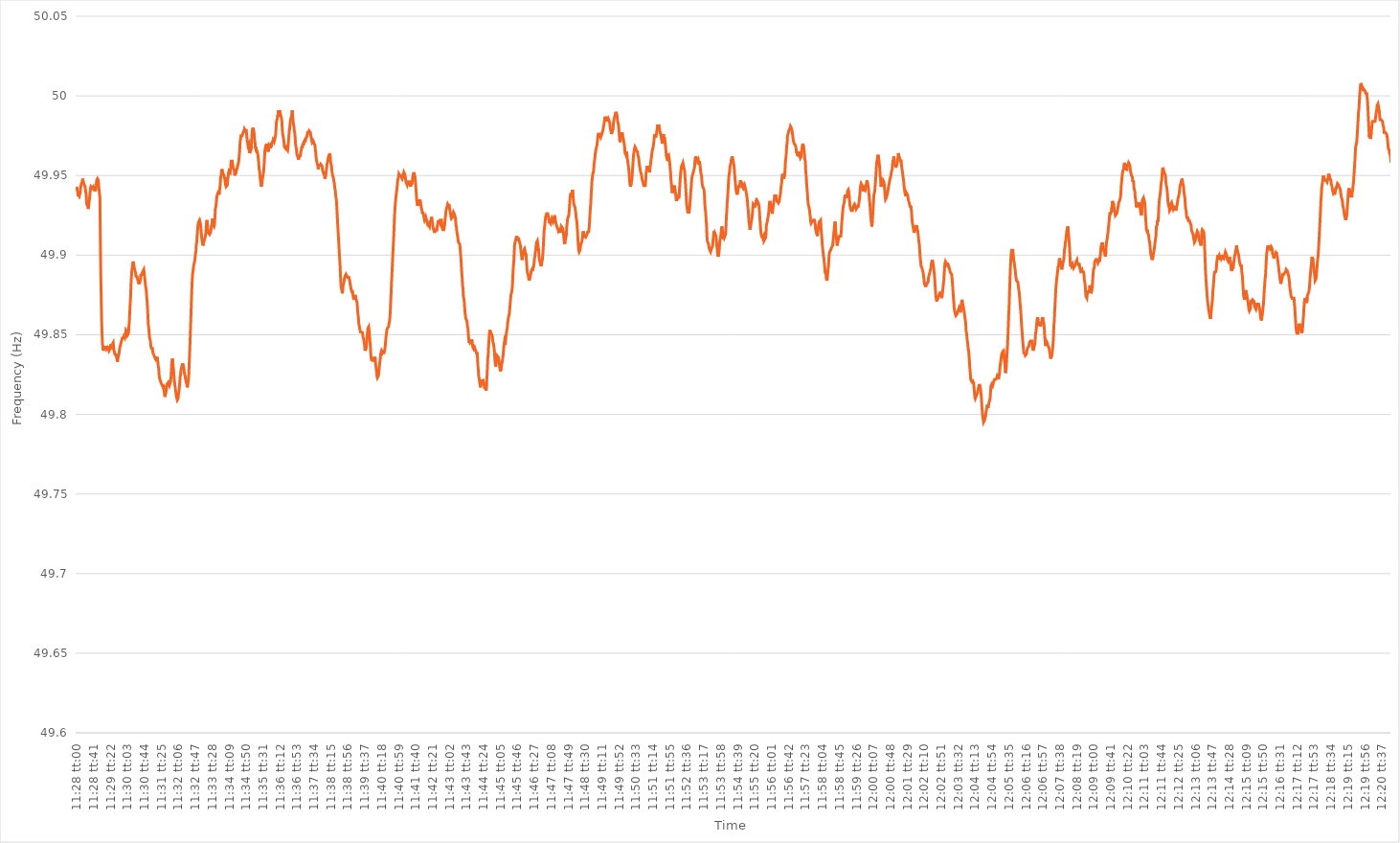
| Category | Series 0 |
|---|---|
| 0.4777777777777778 | 49.943 |
| 0.47778935185185184 | 49.941 |
| 0.47780092592592593 | 49.94 |
| 0.4778125 | 49.937 |
| 0.47782407407407407 | 49.938 |
| 0.4778356481481481 | 49.938 |
| 0.47784722222222226 | 49.937 |
| 0.4778587962962963 | 49.937 |
| 0.4778703703703704 | 49.939 |
| 0.47788194444444443 | 49.942 |
| 0.4778935185185185 | 49.942 |
| 0.47790509259259256 | 49.945 |
| 0.4779166666666667 | 49.945 |
| 0.47792824074074075 | 49.946 |
| 0.47793981481481485 | 49.948 |
| 0.4779513888888889 | 49.947 |
| 0.477962962962963 | 49.946 |
| 0.477974537037037 | 49.946 |
| 0.47798611111111117 | 49.944 |
| 0.4779976851851852 | 49.944 |
| 0.47800925925925924 | 49.943 |
| 0.47802083333333334 | 49.941 |
| 0.4780324074074074 | 49.939 |
| 0.4780439814814815 | 49.937 |
| 0.4780555555555555 | 49.932 |
| 0.47806712962962966 | 49.932 |
| 0.4780787037037037 | 49.931 |
| 0.4780902777777778 | 49.93 |
| 0.47810185185185183 | 49.929 |
| 0.47811342592592593 | 49.932 |
| 0.47812499999999997 | 49.934 |
| 0.4781365740740741 | 49.936 |
| 0.47814814814814816 | 49.939 |
| 0.47815972222222225 | 49.942 |
| 0.4781712962962963 | 49.943 |
| 0.4781828703703704 | 49.943 |
| 0.4781944444444444 | 49.943 |
| 0.47820601851851857 | 49.942 |
| 0.4782175925925926 | 49.942 |
| 0.47822916666666665 | 49.942 |
| 0.47824074074074074 | 49.943 |
| 0.4782523148148148 | 49.942 |
| 0.4782638888888889 | 49.941 |
| 0.4782754629629629 | 49.942 |
| 0.47828703703703707 | 49.94 |
| 0.4782986111111111 | 49.94 |
| 0.4783101851851852 | 49.942 |
| 0.47832175925925924 | 49.944 |
| 0.47833333333333333 | 49.947 |
| 0.47834490740740737 | 49.947 |
| 0.4783564814814815 | 49.948 |
| 0.47836805555555556 | 49.948 |
| 0.47837962962962965 | 49.947 |
| 0.4783912037037037 | 49.943 |
| 0.4784027777777778 | 49.943 |
| 0.4784143518518518 | 49.943 |
| 0.478425925925926 | 49.936 |
| 0.4784375 | 49.908 |
| 0.47844907407407405 | 49.887 |
| 0.47846064814814815 | 49.873 |
| 0.4784722222222222 | 49.859 |
| 0.4784837962962963 | 49.851 |
| 0.4784953703703703 | 49.845 |
| 0.47850694444444447 | 49.842 |
| 0.4785185185185185 | 49.84 |
| 0.4785300925925926 | 49.841 |
| 0.47854166666666664 | 49.841 |
| 0.47855324074074074 | 49.842 |
| 0.4785648148148148 | 49.843 |
| 0.4785763888888889 | 49.841 |
| 0.47858796296296297 | 49.843 |
| 0.47859953703703706 | 49.842 |
| 0.4786111111111111 | 49.841 |
| 0.4786226851851852 | 49.841 |
| 0.47863425925925923 | 49.841 |
| 0.4786458333333334 | 49.842 |
| 0.4786574074074074 | 49.842 |
| 0.4786689814814815 | 49.841 |
| 0.47868055555555555 | 49.84 |
| 0.47869212962962965 | 49.84 |
| 0.4787037037037037 | 49.841 |
| 0.4787152777777777 | 49.842 |
| 0.4787268518518519 | 49.844 |
| 0.4787384259259259 | 49.843 |
| 0.47875 | 49.841 |
| 0.47876157407407405 | 49.842 |
| 0.47877314814814814 | 49.844 |
| 0.4787847222222222 | 49.844 |
| 0.47879629629629633 | 49.845 |
| 0.47880787037037037 | 49.842 |
| 0.47881944444444446 | 49.84 |
| 0.4788310185185185 | 49.839 |
| 0.4788425925925926 | 49.839 |
| 0.47885416666666664 | 49.837 |
| 0.4788657407407408 | 49.838 |
| 0.4788773148148148 | 49.838 |
| 0.4788888888888889 | 49.836 |
| 0.47890046296296296 | 49.835 |
| 0.47891203703703705 | 49.833 |
| 0.4789236111111111 | 49.834 |
| 0.47893518518518513 | 49.836 |
| 0.4789467592592593 | 49.836 |
| 0.4789583333333333 | 49.838 |
| 0.4789699074074074 | 49.84 |
| 0.47898148148148145 | 49.842 |
| 0.47899305555555555 | 49.843 |
| 0.4790046296296296 | 49.844 |
| 0.47901620370370374 | 49.845 |
| 0.4790277777777778 | 49.846 |
| 0.47903935185185187 | 49.847 |
| 0.4790509259259259 | 49.848 |
| 0.4790625 | 49.848 |
| 0.47907407407407404 | 49.848 |
| 0.4790856481481482 | 49.848 |
| 0.47909722222222223 | 49.849 |
| 0.4791087962962963 | 49.849 |
| 0.47912037037037036 | 49.848 |
| 0.47913194444444446 | 49.848 |
| 0.4791435185185185 | 49.85 |
| 0.47915509259259265 | 49.853 |
| 0.4791666666666667 | 49.853 |
| 0.4791782407407407 | 49.853 |
| 0.4791898148148148 | 49.852 |
| 0.47920138888888886 | 49.85 |
| 0.47921296296296295 | 49.85 |
| 0.479224537037037 | 49.851 |
| 0.47923611111111114 | 49.855 |
| 0.4792476851851852 | 49.858 |
| 0.4792592592592593 | 49.864 |
| 0.4792708333333333 | 49.869 |
| 0.4792824074074074 | 49.873 |
| 0.47929398148148145 | 49.881 |
| 0.4793055555555556 | 49.886 |
| 0.47931712962962963 | 49.89 |
| 0.47932870370370373 | 49.892 |
| 0.47934027777777777 | 49.894 |
| 0.47935185185185186 | 49.896 |
| 0.4793634259259259 | 49.895 |
| 0.47937500000000005 | 49.894 |
| 0.4793865740740741 | 49.892 |
| 0.4793981481481482 | 49.892 |
| 0.4794097222222222 | 49.89 |
| 0.47942129629629626 | 49.889 |
| 0.47943287037037036 | 49.887 |
| 0.4794444444444444 | 49.886 |
| 0.47945601851851855 | 49.887 |
| 0.4794675925925926 | 49.886 |
| 0.4794791666666667 | 49.886 |
| 0.4794907407407407 | 49.884 |
| 0.4795023148148148 | 49.882 |
| 0.47951388888888885 | 49.883 |
| 0.479525462962963 | 49.882 |
| 0.47953703703703704 | 49.882 |
| 0.47954861111111113 | 49.884 |
| 0.4795601851851852 | 49.885 |
| 0.47957175925925927 | 49.888 |
| 0.4795833333333333 | 49.887 |
| 0.47959490740740746 | 49.888 |
| 0.4796064814814815 | 49.888 |
| 0.4796180555555556 | 49.888 |
| 0.47962962962962963 | 49.89 |
| 0.47964120370370367 | 49.89 |
| 0.47965277777777776 | 49.891 |
| 0.4796643518518518 | 49.889 |
| 0.47967592592592595 | 49.886 |
| 0.4796875 | 49.884 |
| 0.4796990740740741 | 49.881 |
| 0.4797106481481481 | 49.881 |
| 0.4797222222222222 | 49.878 |
| 0.47973379629629626 | 49.874 |
| 0.4797453703703704 | 49.871 |
| 0.47975694444444444 | 49.867 |
| 0.47976851851851854 | 49.862 |
| 0.4797800925925926 | 49.856 |
| 0.47979166666666667 | 49.854 |
| 0.4798032407407407 | 49.851 |
| 0.47981481481481486 | 49.848 |
| 0.4798263888888889 | 49.847 |
| 0.479837962962963 | 49.846 |
| 0.47984953703703703 | 49.843 |
| 0.4798611111111111 | 49.843 |
| 0.47987268518518517 | 49.841 |
| 0.4798842592592593 | 49.842 |
| 0.47989583333333335 | 49.841 |
| 0.4799074074074074 | 49.839 |
| 0.4799189814814815 | 49.838 |
| 0.4799305555555555 | 49.838 |
| 0.4799421296296296 | 49.837 |
| 0.47995370370370366 | 49.836 |
| 0.4799652777777778 | 49.836 |
| 0.47997685185185185 | 49.835 |
| 0.47998842592592594 | 49.836 |
| 0.48 | 49.835 |
| 0.4800115740740741 | 49.834 |
| 0.4800231481481481 | 49.836 |
| 0.48003472222222227 | 49.834 |
| 0.4800462962962963 | 49.833 |
| 0.4800578703703704 | 49.83 |
| 0.48006944444444444 | 49.829 |
| 0.48008101851851853 | 49.825 |
| 0.48009259259259257 | 49.823 |
| 0.4801041666666667 | 49.822 |
| 0.48011574074074076 | 49.821 |
| 0.4801273148148148 | 49.821 |
| 0.4801388888888889 | 49.821 |
| 0.48015046296296293 | 49.819 |
| 0.480162037037037 | 49.819 |
| 0.48017361111111106 | 49.818 |
| 0.4801851851851852 | 49.819 |
| 0.48019675925925925 | 49.817 |
| 0.48020833333333335 | 49.818 |
| 0.4802199074074074 | 49.815 |
| 0.4802314814814815 | 49.813 |
| 0.4802430555555555 | 49.811 |
| 0.48025462962962967 | 49.811 |
| 0.4802662037037037 | 49.811 |
| 0.4802777777777778 | 49.815 |
| 0.48028935185185184 | 49.816 |
| 0.48030092592592594 | 49.819 |
| 0.4803125 | 49.819 |
| 0.4803240740740741 | 49.819 |
| 0.48033564814814816 | 49.82 |
| 0.4803472222222222 | 49.819 |
| 0.4803587962962963 | 49.819 |
| 0.48037037037037034 | 49.818 |
| 0.48038194444444443 | 49.819 |
| 0.48039351851851847 | 49.82 |
| 0.4804050925925926 | 49.821 |
| 0.48041666666666666 | 49.824 |
| 0.48042824074074075 | 49.829 |
| 0.4804398148148148 | 49.833 |
| 0.4804513888888889 | 49.835 |
| 0.4804629629629629 | 49.834 |
| 0.4804745370370371 | 49.83 |
| 0.4804861111111111 | 49.828 |
| 0.4804976851851852 | 49.824 |
| 0.48050925925925925 | 49.821 |
| 0.48052083333333334 | 49.819 |
| 0.4805324074074074 | 49.817 |
| 0.48054398148148153 | 49.815 |
| 0.48055555555555557 | 49.813 |
| 0.48056712962962966 | 49.811 |
| 0.4805787037037037 | 49.811 |
| 0.48059027777777774 | 49.809 |
| 0.48060185185185184 | 49.809 |
| 0.4806134259259259 | 49.81 |
| 0.480625 | 49.813 |
| 0.48063657407407406 | 49.814 |
| 0.48064814814814816 | 49.817 |
| 0.4806597222222222 | 49.82 |
| 0.4806712962962963 | 49.824 |
| 0.48068287037037033 | 49.825 |
| 0.4806944444444445 | 49.828 |
| 0.4807060185185185 | 49.829 |
| 0.4807175925925926 | 49.83 |
| 0.48072916666666665 | 49.83 |
| 0.48074074074074075 | 49.832 |
| 0.4807523148148148 | 49.831 |
| 0.48076388888888894 | 49.83 |
| 0.480775462962963 | 49.829 |
| 0.48078703703703707 | 49.826 |
| 0.4807986111111111 | 49.826 |
| 0.4808101851851852 | 49.824 |
| 0.48082175925925924 | 49.822 |
| 0.4808333333333333 | 49.822 |
| 0.48084490740740743 | 49.82 |
| 0.48085648148148147 | 49.819 |
| 0.48086805555555556 | 49.817 |
| 0.4808796296296296 | 49.818 |
| 0.4808912037037037 | 49.82 |
| 0.48090277777777773 | 49.822 |
| 0.4809143518518519 | 49.826 |
| 0.4809259259259259 | 49.833 |
| 0.4809375 | 49.839 |
| 0.48094907407407406 | 49.846 |
| 0.48096064814814815 | 49.854 |
| 0.4809722222222222 | 49.862 |
| 0.48098379629629634 | 49.87 |
| 0.4809953703703704 | 49.877 |
| 0.4810069444444445 | 49.884 |
| 0.4810185185185185 | 49.888 |
| 0.4810300925925926 | 49.89 |
| 0.48104166666666665 | 49.892 |
| 0.4810532407407408 | 49.894 |
| 0.48106481481481483 | 49.895 |
| 0.4810763888888889 | 49.896 |
| 0.48108796296296297 | 49.898 |
| 0.481099537037037 | 49.901 |
| 0.4811111111111111 | 49.902 |
| 0.48112268518518514 | 49.907 |
| 0.4811342592592593 | 49.908 |
| 0.48114583333333333 | 49.912 |
| 0.4811574074074074 | 49.915 |
| 0.48116898148148146 | 49.919 |
| 0.48118055555555556 | 49.919 |
| 0.4811921296296296 | 49.921 |
| 0.48120370370370374 | 49.921 |
| 0.4812152777777778 | 49.922 |
| 0.4812268518518519 | 49.922 |
| 0.4812384259259259 | 49.92 |
| 0.48125 | 49.917 |
| 0.48126157407407405 | 49.914 |
| 0.4812731481481482 | 49.911 |
| 0.48128472222222224 | 49.909 |
| 0.48129629629629633 | 49.909 |
| 0.48130787037037037 | 49.906 |
| 0.4813194444444444 | 49.907 |
| 0.4813310185185185 | 49.907 |
| 0.48134259259259254 | 49.909 |
| 0.4813541666666667 | 49.909 |
| 0.48136574074074073 | 49.909 |
| 0.4813773148148148 | 49.912 |
| 0.48138888888888887 | 49.914 |
| 0.48140046296296296 | 49.918 |
| 0.481412037037037 | 49.921 |
| 0.48142361111111115 | 49.922 |
| 0.4814351851851852 | 49.919 |
| 0.4814467592592593 | 49.915 |
| 0.4814583333333333 | 49.914 |
| 0.4814699074074074 | 49.914 |
| 0.48148148148148145 | 49.914 |
| 0.4814930555555556 | 49.913 |
| 0.48150462962962964 | 49.913 |
| 0.48151620370370374 | 49.914 |
| 0.4815277777777778 | 49.915 |
| 0.4815393518518518 | 49.917 |
| 0.4815509259259259 | 49.919 |
| 0.48156249999999995 | 49.92 |
| 0.4815740740740741 | 49.923 |
| 0.48158564814814814 | 49.922 |
| 0.48159722222222223 | 49.919 |
| 0.48160879629629627 | 49.919 |
| 0.48162037037037037 | 49.918 |
| 0.4816319444444444 | 49.919 |
| 0.48164351851851855 | 49.923 |
| 0.4816550925925926 | 49.929 |
| 0.4816666666666667 | 49.93 |
| 0.4816782407407407 | 49.932 |
| 0.4816898148148148 | 49.935 |
| 0.48170138888888886 | 49.937 |
| 0.481712962962963 | 49.937 |
| 0.48172453703703705 | 49.939 |
| 0.48173611111111114 | 49.939 |
| 0.4817476851851852 | 49.94 |
| 0.4817592592592593 | 49.938 |
| 0.4817708333333333 | 49.94 |
| 0.48178240740740735 | 49.942 |
| 0.4817939814814815 | 49.945 |
| 0.48180555555555554 | 49.949 |
| 0.48181712962962964 | 49.95 |
| 0.4818287037037037 | 49.953 |
| 0.48184027777777777 | 49.954 |
| 0.4818518518518518 | 49.953 |
| 0.48186342592592596 | 49.953 |
| 0.481875 | 49.951 |
| 0.4818865740740741 | 49.951 |
| 0.48189814814814813 | 49.95 |
| 0.4819097222222222 | 49.948 |
| 0.48192129629629626 | 49.949 |
| 0.4819328703703704 | 49.949 |
| 0.48194444444444445 | 49.944 |
| 0.48195601851851855 | 49.943 |
| 0.4819675925925926 | 49.943 |
| 0.4819791666666667 | 49.943 |
| 0.4819907407407407 | 49.944 |
| 0.48200231481481487 | 49.948 |
| 0.4820138888888889 | 49.949 |
| 0.48202546296296295 | 49.952 |
| 0.48203703703703704 | 49.953 |
| 0.4820486111111111 | 49.953 |
| 0.4820601851851852 | 49.953 |
| 0.4820717592592592 | 49.952 |
| 0.48208333333333336 | 49.954 |
| 0.4820949074074074 | 49.959 |
| 0.4821064814814815 | 49.959 |
| 0.48211805555555554 | 49.959 |
| 0.48212962962962963 | 49.959 |
| 0.48214120370370367 | 49.959 |
| 0.4821527777777778 | 49.955 |
| 0.48216435185185186 | 49.955 |
| 0.48217592592592595 | 49.954 |
| 0.4821875 | 49.953 |
| 0.4821990740740741 | 49.95 |
| 0.4822106481481481 | 49.952 |
| 0.4822222222222223 | 49.951 |
| 0.4822337962962963 | 49.952 |
| 0.48224537037037035 | 49.953 |
| 0.48225694444444445 | 49.954 |
| 0.4822685185185185 | 49.955 |
| 0.4822800925925926 | 49.956 |
| 0.4822916666666666 | 49.957 |
| 0.48230324074074077 | 49.958 |
| 0.4823148148148148 | 49.96 |
| 0.4823263888888889 | 49.963 |
| 0.48233796296296294 | 49.966 |
| 0.48234953703703703 | 49.971 |
| 0.4823611111111111 | 49.973 |
| 0.4823726851851852 | 49.975 |
| 0.48238425925925926 | 49.975 |
| 0.48239583333333336 | 49.975 |
| 0.4824074074074074 | 49.975 |
| 0.4824189814814815 | 49.976 |
| 0.48243055555555553 | 49.976 |
| 0.4824421296296297 | 49.976 |
| 0.4824537037037037 | 49.978 |
| 0.4824652777777778 | 49.977 |
| 0.48247685185185185 | 49.979 |
| 0.4824884259259259 | 49.979 |
| 0.4825 | 49.978 |
| 0.482511574074074 | 49.979 |
| 0.4825231481481482 | 49.978 |
| 0.4825347222222222 | 49.975 |
| 0.4825462962962963 | 49.972 |
| 0.48255787037037035 | 49.971 |
| 0.48256944444444444 | 49.969 |
| 0.4825810185185185 | 49.969 |
| 0.48259259259259263 | 49.97 |
| 0.48260416666666667 | 49.966 |
| 0.48261574074074076 | 49.964 |
| 0.4826273148148148 | 49.964 |
| 0.4826388888888889 | 49.964 |
| 0.48265046296296293 | 49.966 |
| 0.4826620370370371 | 49.967 |
| 0.4826736111111111 | 49.973 |
| 0.4826851851851852 | 49.977 |
| 0.48269675925925926 | 49.979 |
| 0.48270833333333335 | 49.98 |
| 0.4827199074074074 | 49.98 |
| 0.48273148148148143 | 49.978 |
| 0.4827430555555556 | 49.976 |
| 0.4827546296296296 | 49.972 |
| 0.4827662037037037 | 49.971 |
| 0.48277777777777775 | 49.967 |
| 0.48278935185185184 | 49.968 |
| 0.4828009259259259 | 49.965 |
| 0.48281250000000003 | 49.966 |
| 0.48282407407407407 | 49.966 |
| 0.48283564814814817 | 49.964 |
| 0.4828472222222222 | 49.963 |
| 0.4828587962962963 | 49.96 |
| 0.48287037037037034 | 49.958 |
| 0.4828819444444445 | 49.954 |
| 0.4828935185185185 | 49.953 |
| 0.4829050925925926 | 49.95 |
| 0.48291666666666666 | 49.947 |
| 0.48292824074074076 | 49.945 |
| 0.4829398148148148 | 49.943 |
| 0.48295138888888894 | 49.944 |
| 0.482962962962963 | 49.945 |
| 0.482974537037037 | 49.948 |
| 0.4829861111111111 | 49.948 |
| 0.48299768518518515 | 49.951 |
| 0.48300925925925925 | 49.953 |
| 0.4830208333333333 | 49.957 |
| 0.48303240740740744 | 49.961 |
| 0.4830439814814815 | 49.966 |
| 0.48305555555555557 | 49.967 |
| 0.4830671296296296 | 49.969 |
| 0.4830787037037037 | 49.968 |
| 0.48309027777777774 | 49.97 |
| 0.4831018518518519 | 49.969 |
| 0.48311342592592593 | 49.966 |
| 0.483125 | 49.967 |
| 0.48313657407407407 | 49.965 |
| 0.48314814814814816 | 49.968 |
| 0.4831597222222222 | 49.969 |
| 0.48317129629629635 | 49.969 |
| 0.4831828703703704 | 49.968 |
| 0.4831944444444444 | 49.967 |
| 0.4832060185185185 | 49.969 |
| 0.48321759259259256 | 49.968 |
| 0.48322916666666665 | 49.97 |
| 0.4832407407407407 | 49.97 |
| 0.48325231481481484 | 49.971 |
| 0.4832638888888889 | 49.97 |
| 0.483275462962963 | 49.972 |
| 0.483287037037037 | 49.972 |
| 0.4832986111111111 | 49.971 |
| 0.48331018518518515 | 49.971 |
| 0.4833217592592593 | 49.973 |
| 0.48333333333333334 | 49.973 |
| 0.48334490740740743 | 49.976 |
| 0.48335648148148147 | 49.98 |
| 0.48336805555555556 | 49.984 |
| 0.4833796296296296 | 49.985 |
| 0.48339120370370375 | 49.986 |
| 0.4834027777777778 | 49.988 |
| 0.4834143518518519 | 49.987 |
| 0.4834259259259259 | 49.991 |
| 0.48343749999999996 | 49.989 |
| 0.48344907407407406 | 49.991 |
| 0.4834606481481481 | 49.99 |
| 0.48347222222222225 | 49.989 |
| 0.4834837962962963 | 49.988 |
| 0.4834953703703704 | 49.987 |
| 0.4835069444444444 | 49.986 |
| 0.4835185185185185 | 49.984 |
| 0.48353009259259255 | 49.979 |
| 0.4835416666666667 | 49.976 |
| 0.48355324074074074 | 49.976 |
| 0.48356481481481484 | 49.973 |
| 0.4835763888888889 | 49.971 |
| 0.48358796296296297 | 49.968 |
| 0.483599537037037 | 49.968 |
| 0.48361111111111116 | 49.968 |
| 0.4836226851851852 | 49.967 |
| 0.4836342592592593 | 49.969 |
| 0.48364583333333333 | 49.968 |
| 0.4836574074074074 | 49.967 |
| 0.48366898148148146 | 49.967 |
| 0.4836805555555555 | 49.966 |
| 0.48369212962962965 | 49.968 |
| 0.4837037037037037 | 49.972 |
| 0.4837152777777778 | 49.975 |
| 0.4837268518518518 | 49.978 |
| 0.4837384259259259 | 49.98 |
| 0.48374999999999996 | 49.983 |
| 0.4837615740740741 | 49.985 |
| 0.48377314814814815 | 49.986 |
| 0.48378472222222224 | 49.987 |
| 0.4837962962962963 | 49.988 |
| 0.4838078703703704 | 49.991 |
| 0.4838194444444444 | 49.987 |
| 0.48383101851851856 | 49.985 |
| 0.4838425925925926 | 49.982 |
| 0.4838541666666667 | 49.981 |
| 0.48386574074074074 | 49.978 |
| 0.48387731481481483 | 49.977 |
| 0.48388888888888887 | 49.974 |
| 0.483900462962963 | 49.97 |
| 0.48391203703703706 | 49.968 |
| 0.4839236111111111 | 49.967 |
| 0.4839351851851852 | 49.964 |
| 0.48394675925925923 | 49.964 |
| 0.4839583333333333 | 49.962 |
| 0.48396990740740736 | 49.961 |
| 0.4839814814814815 | 49.96 |
| 0.48399305555555555 | 49.962 |
| 0.48400462962962965 | 49.961 |
| 0.4840162037037037 | 49.963 |
| 0.4840277777777778 | 49.962 |
| 0.4840393518518518 | 49.963 |
| 0.48405092592592597 | 49.965 |
| 0.4840625 | 49.966 |
| 0.4840740740740741 | 49.968 |
| 0.48408564814814814 | 49.967 |
| 0.48409722222222223 | 49.969 |
| 0.4841087962962963 | 49.97 |
| 0.4841203703703704 | 49.969 |
| 0.48413194444444446 | 49.971 |
| 0.4841435185185185 | 49.971 |
| 0.4841550925925926 | 49.972 |
| 0.48416666666666663 | 49.971 |
| 0.48417824074074073 | 49.972 |
| 0.48418981481481477 | 49.973 |
| 0.4842013888888889 | 49.973 |
| 0.48421296296296296 | 49.973 |
| 0.48422453703703705 | 49.975 |
| 0.4842361111111111 | 49.977 |
| 0.4842476851851852 | 49.977 |
| 0.4842592592592592 | 49.977 |
| 0.4842708333333334 | 49.977 |
| 0.4842824074074074 | 49.978 |
| 0.4842939814814815 | 49.978 |
| 0.48430555555555554 | 49.978 |
| 0.48431712962962964 | 49.977 |
| 0.4843287037037037 | 49.975 |
| 0.48434027777777783 | 49.974 |
| 0.48435185185185187 | 49.972 |
| 0.48436342592592596 | 49.971 |
| 0.484375 | 49.971 |
| 0.48438657407407404 | 49.972 |
| 0.48439814814814813 | 49.972 |
| 0.48440972222222217 | 49.971 |
| 0.4844212962962963 | 49.97 |
| 0.48443287037037036 | 49.97 |
| 0.48444444444444446 | 49.969 |
| 0.4844560185185185 | 49.966 |
| 0.4844675925925926 | 49.964 |
| 0.4844791666666666 | 49.961 |
| 0.4844907407407408 | 49.961 |
| 0.4845023148148148 | 49.958 |
| 0.4845138888888889 | 49.957 |
| 0.48452546296296295 | 49.956 |
| 0.48453703703703704 | 49.954 |
| 0.4845486111111111 | 49.956 |
| 0.48456018518518523 | 49.957 |
| 0.48457175925925927 | 49.956 |
| 0.48458333333333337 | 49.957 |
| 0.4845949074074074 | 49.956 |
| 0.4846064814814815 | 49.957 |
| 0.48461805555555554 | 49.957 |
| 0.4846296296296296 | 49.957 |
| 0.4846412037037037 | 49.956 |
| 0.48465277777777777 | 49.954 |
| 0.48466435185185186 | 49.953 |
| 0.4846759259259259 | 49.952 |
| 0.4846875 | 49.951 |
| 0.48469907407407403 | 49.951 |
| 0.4847106481481482 | 49.95 |
| 0.4847222222222222 | 49.948 |
| 0.4847337962962963 | 49.948 |
| 0.48474537037037035 | 49.95 |
| 0.48475694444444445 | 49.952 |
| 0.4847685185185185 | 49.954 |
| 0.48478009259259264 | 49.957 |
| 0.4847916666666667 | 49.958 |
| 0.48480324074074077 | 49.959 |
| 0.4848148148148148 | 49.961 |
| 0.4848263888888889 | 49.962 |
| 0.48483796296296294 | 49.963 |
| 0.484849537037037 | 49.962 |
| 0.48486111111111113 | 49.964 |
| 0.48487268518518517 | 49.961 |
| 0.48488425925925926 | 49.958 |
| 0.4848958333333333 | 49.957 |
| 0.4849074074074074 | 49.956 |
| 0.48491898148148144 | 49.953 |
| 0.4849305555555556 | 49.951 |
| 0.4849421296296296 | 49.95 |
| 0.4849537037037037 | 49.949 |
| 0.48496527777777776 | 49.948 |
| 0.48497685185185185 | 49.946 |
| 0.4849884259259259 | 49.945 |
| 0.48500000000000004 | 49.942 |
| 0.4850115740740741 | 49.941 |
| 0.4850231481481482 | 49.938 |
| 0.4850347222222222 | 49.936 |
| 0.4850462962962963 | 49.934 |
| 0.48505787037037035 | 49.929 |
| 0.4850694444444445 | 49.925 |
| 0.48508101851851854 | 49.919 |
| 0.4850925925925926 | 49.915 |
| 0.48510416666666667 | 49.91 |
| 0.4851157407407407 | 49.906 |
| 0.4851273148148148 | 49.901 |
| 0.48513888888888884 | 49.897 |
| 0.485150462962963 | 49.892 |
| 0.48516203703703703 | 49.885 |
| 0.4851736111111111 | 49.881 |
| 0.48518518518518516 | 49.879 |
| 0.48519675925925926 | 49.878 |
| 0.4852083333333333 | 49.876 |
| 0.48521990740740745 | 49.878 |
| 0.4852314814814815 | 49.881 |
| 0.4852430555555556 | 49.881 |
| 0.4852546296296296 | 49.883 |
| 0.4852662037037037 | 49.885 |
| 0.48527777777777775 | 49.886 |
| 0.4852893518518519 | 49.887 |
| 0.48530092592592594 | 49.887 |
| 0.48531250000000004 | 49.888 |
| 0.4853240740740741 | 49.888 |
| 0.4853356481481481 | 49.887 |
| 0.4853472222222222 | 49.887 |
| 0.48535879629629625 | 49.886 |
| 0.4853703703703704 | 49.886 |
| 0.48538194444444444 | 49.886 |
| 0.48539351851851853 | 49.886 |
| 0.48540509259259257 | 49.886 |
| 0.48541666666666666 | 49.884 |
| 0.4854282407407407 | 49.882 |
| 0.48543981481481485 | 49.881 |
| 0.4854513888888889 | 49.879 |
| 0.485462962962963 | 49.878 |
| 0.485474537037037 | 49.877 |
| 0.4854861111111111 | 49.878 |
| 0.48549768518518516 | 49.876 |
| 0.4855092592592593 | 49.875 |
| 0.48552083333333335 | 49.873 |
| 0.48553240740740744 | 49.872 |
| 0.4855439814814815 | 49.874 |
| 0.4855555555555556 | 49.873 |
| 0.4855671296296296 | 49.875 |
| 0.48557870370370365 | 49.875 |
| 0.4855902777777778 | 49.873 |
| 0.48560185185185184 | 49.873 |
| 0.48561342592592593 | 49.871 |
| 0.485625 | 49.87 |
| 0.48563657407407407 | 49.866 |
| 0.4856481481481481 | 49.863 |
| 0.48565972222222226 | 49.861 |
| 0.4856712962962963 | 49.857 |
| 0.4856828703703704 | 49.856 |
| 0.48569444444444443 | 49.854 |
| 0.4857060185185185 | 49.854 |
| 0.48571759259259256 | 49.852 |
| 0.4857291666666667 | 49.851 |
| 0.48574074074074075 | 49.852 |
| 0.48575231481481485 | 49.851 |
| 0.4857638888888889 | 49.852 |
| 0.485775462962963 | 49.851 |
| 0.485787037037037 | 49.849 |
| 0.48579861111111106 | 49.848 |
| 0.4858101851851852 | 49.847 |
| 0.48582175925925924 | 49.845 |
| 0.48583333333333334 | 49.844 |
| 0.4858449074074074 | 49.84 |
| 0.4858564814814815 | 49.84 |
| 0.4858680555555555 | 49.84 |
| 0.48587962962962966 | 49.842 |
| 0.4858912037037037 | 49.845 |
| 0.4859027777777778 | 49.849 |
| 0.48591435185185183 | 49.851 |
| 0.48592592592592593 | 49.854 |
| 0.48593749999999997 | 49.854 |
| 0.4859490740740741 | 49.855 |
| 0.48596064814814816 | 49.855 |
| 0.48597222222222225 | 49.85 |
| 0.4859837962962963 | 49.846 |
| 0.4859953703703704 | 49.843 |
| 0.4860069444444444 | 49.838 |
| 0.48601851851851857 | 49.835 |
| 0.4860300925925926 | 49.834 |
| 0.48604166666666665 | 49.834 |
| 0.48605324074074074 | 49.834 |
| 0.4860648148148148 | 49.834 |
| 0.4860763888888889 | 49.834 |
| 0.4860879629629629 | 49.835 |
| 0.48609953703703707 | 49.836 |
| 0.4861111111111111 | 49.833 |
| 0.4861226851851852 | 49.836 |
| 0.48613425925925924 | 49.834 |
| 0.48614583333333333 | 49.831 |
| 0.48615740740740737 | 49.829 |
| 0.4861689814814815 | 49.827 |
| 0.48618055555555556 | 49.824 |
| 0.48619212962962965 | 49.823 |
| 0.4862037037037037 | 49.823 |
| 0.4862152777777778 | 49.824 |
| 0.4862268518518518 | 49.825 |
| 0.486238425925926 | 49.828 |
| 0.48625 | 49.831 |
| 0.4862615740740741 | 49.833 |
| 0.48627314814814815 | 49.835 |
| 0.4862847222222222 | 49.838 |
| 0.4862962962962963 | 49.839 |
| 0.4863078703703703 | 49.84 |
| 0.48631944444444447 | 49.84 |
| 0.4863310185185185 | 49.839 |
| 0.4863425925925926 | 49.84 |
| 0.48635416666666664 | 49.839 |
| 0.48636574074074074 | 49.838 |
| 0.4863773148148148 | 49.838 |
| 0.4863888888888889 | 49.84 |
| 0.48640046296296297 | 49.841 |
| 0.48641203703703706 | 49.843 |
| 0.4864236111111111 | 49.846 |
| 0.4864351851851852 | 49.849 |
| 0.48644675925925923 | 49.851 |
| 0.4864583333333334 | 49.853 |
| 0.4864699074074074 | 49.854 |
| 0.4864814814814815 | 49.854 |
| 0.48649305555555555 | 49.854 |
| 0.48650462962962965 | 49.855 |
| 0.4865162037037037 | 49.857 |
| 0.4865277777777777 | 49.858 |
| 0.4865393518518519 | 49.86 |
| 0.4865509259259259 | 49.864 |
| 0.4865625 | 49.87 |
| 0.48657407407407405 | 49.875 |
| 0.48658564814814814 | 49.882 |
| 0.4865972222222222 | 49.887 |
| 0.48660879629629633 | 49.893 |
| 0.48662037037037037 | 49.898 |
| 0.48663194444444446 | 49.904 |
| 0.4866435185185185 | 49.909 |
| 0.4866550925925926 | 49.915 |
| 0.48666666666666664 | 49.922 |
| 0.4866782407407408 | 49.927 |
| 0.4866898148148148 | 49.931 |
| 0.4867013888888889 | 49.934 |
| 0.48671296296296296 | 49.937 |
| 0.48672453703703705 | 49.939 |
| 0.4867361111111111 | 49.941 |
| 0.48674768518518513 | 49.943 |
| 0.4867592592592593 | 49.947 |
| 0.4867708333333333 | 49.948 |
| 0.4867824074074074 | 49.949 |
| 0.48679398148148145 | 49.951 |
| 0.48680555555555555 | 49.951 |
| 0.4868171296296296 | 49.95 |
| 0.48682870370370374 | 49.95 |
| 0.4868402777777778 | 49.95 |
| 0.48685185185185187 | 49.95 |
| 0.4868634259259259 | 49.949 |
| 0.486875 | 49.949 |
| 0.48688657407407404 | 49.948 |
| 0.4868981481481482 | 49.949 |
| 0.48690972222222223 | 49.95 |
| 0.4869212962962963 | 49.951 |
| 0.48693287037037036 | 49.952 |
| 0.48694444444444446 | 49.952 |
| 0.4869560185185185 | 49.952 |
| 0.48696759259259265 | 49.95 |
| 0.4869791666666667 | 49.948 |
| 0.4869907407407407 | 49.946 |
| 0.4870023148148148 | 49.946 |
| 0.48701388888888886 | 49.946 |
| 0.48702546296296295 | 49.944 |
| 0.487037037037037 | 49.945 |
| 0.48704861111111114 | 49.944 |
| 0.4870601851851852 | 49.946 |
| 0.4870717592592593 | 49.946 |
| 0.4870833333333333 | 49.946 |
| 0.4870949074074074 | 49.946 |
| 0.48710648148148145 | 49.944 |
| 0.4871180555555556 | 49.943 |
| 0.48712962962962963 | 49.944 |
| 0.48714120370370373 | 49.944 |
| 0.48715277777777777 | 49.944 |
| 0.48716435185185186 | 49.945 |
| 0.4871759259259259 | 49.948 |
| 0.48718750000000005 | 49.95 |
| 0.4871990740740741 | 49.951 |
| 0.4872106481481482 | 49.952 |
| 0.4872222222222222 | 49.952 |
| 0.48723379629629626 | 49.95 |
| 0.48724537037037036 | 49.949 |
| 0.4872569444444444 | 49.946 |
| 0.48726851851851855 | 49.943 |
| 0.4872800925925926 | 49.939 |
| 0.4872916666666667 | 49.935 |
| 0.4873032407407407 | 49.933 |
| 0.4873148148148148 | 49.931 |
| 0.48732638888888885 | 49.932 |
| 0.487337962962963 | 49.934 |
| 0.48734953703703704 | 49.935 |
| 0.48736111111111113 | 49.934 |
| 0.4873726851851852 | 49.934 |
| 0.48738425925925927 | 49.934 |
| 0.4873958333333333 | 49.934 |
| 0.48740740740740746 | 49.932 |
| 0.4874189814814815 | 49.93 |
| 0.4874305555555556 | 49.929 |
| 0.48744212962962963 | 49.928 |
| 0.48745370370370367 | 49.926 |
| 0.48746527777777776 | 49.927 |
| 0.4874768518518518 | 49.926 |
| 0.48748842592592595 | 49.925 |
| 0.4875 | 49.923 |
| 0.4875115740740741 | 49.922 |
| 0.4875231481481481 | 49.922 |
| 0.4875347222222222 | 49.922 |
| 0.48754629629629626 | 49.924 |
| 0.4875578703703704 | 49.923 |
| 0.48756944444444444 | 49.922 |
| 0.48758101851851854 | 49.921 |
| 0.4875925925925926 | 49.92 |
| 0.48760416666666667 | 49.92 |
| 0.4876157407407407 | 49.918 |
| 0.48762731481481486 | 49.919 |
| 0.4876388888888889 | 49.919 |
| 0.487650462962963 | 49.918 |
| 0.48766203703703703 | 49.92 |
| 0.4876736111111111 | 49.921 |
| 0.48768518518518517 | 49.921 |
| 0.4876967592592592 | 49.922 |
| 0.48770833333333335 | 49.924 |
| 0.4877199074074074 | 49.922 |
| 0.4877314814814815 | 49.921 |
| 0.4877430555555555 | 49.918 |
| 0.4877546296296296 | 49.917 |
| 0.48776620370370366 | 49.916 |
| 0.4877777777777778 | 49.915 |
| 0.48778935185185185 | 49.914 |
| 0.48780092592592594 | 49.915 |
| 0.4878125 | 49.915 |
| 0.4878240740740741 | 49.915 |
| 0.4878356481481481 | 49.916 |
| 0.48784722222222227 | 49.915 |
| 0.4878587962962963 | 49.917 |
| 0.4878703703703704 | 49.918 |
| 0.48788194444444444 | 49.92 |
| 0.48789351851851853 | 49.921 |
| 0.48790509259259257 | 49.922 |
| 0.4879166666666667 | 49.921 |
| 0.48792824074074076 | 49.921 |
| 0.4879398148148148 | 49.92 |
| 0.4879513888888889 | 49.922 |
| 0.48796296296296293 | 49.922 |
| 0.487974537037037 | 49.922 |
| 0.48798611111111106 | 49.922 |
| 0.4879976851851852 | 49.919 |
| 0.48800925925925925 | 49.917 |
| 0.48802083333333335 | 49.916 |
| 0.4880324074074074 | 49.916 |
| 0.4880439814814815 | 49.916 |
| 0.4880555555555555 | 49.916 |
| 0.48806712962962967 | 49.918 |
| 0.4880787037037037 | 49.92 |
| 0.4880902777777778 | 49.923 |
| 0.48810185185185184 | 49.925 |
| 0.48811342592592594 | 49.928 |
| 0.488125 | 49.928 |
| 0.4881365740740741 | 49.93 |
| 0.48814814814814816 | 49.931 |
| 0.48815972222222226 | 49.932 |
| 0.4881712962962963 | 49.932 |
| 0.48818287037037034 | 49.931 |
| 0.48819444444444443 | 49.932 |
| 0.48820601851851847 | 49.93 |
| 0.4882175925925926 | 49.929 |
| 0.48822916666666666 | 49.927 |
| 0.48824074074074075 | 49.926 |
| 0.4882523148148148 | 49.924 |
| 0.4882638888888889 | 49.923 |
| 0.4882754629629629 | 49.923 |
| 0.4882870370370371 | 49.923 |
| 0.4882986111111111 | 49.924 |
| 0.4883101851851852 | 49.926 |
| 0.48832175925925925 | 49.927 |
| 0.48833333333333334 | 49.927 |
| 0.4883449074074074 | 49.926 |
| 0.48835648148148153 | 49.925 |
| 0.48836805555555557 | 49.924 |
| 0.48837962962962966 | 49.923 |
| 0.4883912037037037 | 49.919 |
| 0.48840277777777774 | 49.918 |
| 0.48841435185185184 | 49.915 |
| 0.4884259259259259 | 49.915 |
| 0.4884375 | 49.912 |
| 0.48844907407407406 | 49.91 |
| 0.48846064814814816 | 49.908 |
| 0.4884722222222222 | 49.908 |
| 0.4884837962962963 | 49.908 |
| 0.48849537037037033 | 49.907 |
| 0.4885069444444445 | 49.905 |
| 0.4885185185185185 | 49.901 |
| 0.4885300925925926 | 49.898 |
| 0.48854166666666665 | 49.894 |
| 0.48855324074074075 | 49.889 |
| 0.4885648148148148 | 49.886 |
| 0.48857638888888894 | 49.881 |
| 0.488587962962963 | 49.879 |
| 0.48859953703703707 | 49.874 |
| 0.4886111111111111 | 49.873 |
| 0.4886226851851852 | 49.871 |
| 0.48863425925925924 | 49.867 |
| 0.4886458333333333 | 49.864 |
| 0.48865740740740743 | 49.862 |
| 0.48866898148148147 | 49.86 |
| 0.48868055555555556 | 49.86 |
| 0.4886921296296296 | 49.859 |
| 0.4887037037037037 | 49.858 |
| 0.48871527777777773 | 49.855 |
| 0.4887268518518519 | 49.854 |
| 0.4887384259259259 | 49.85 |
| 0.48875 | 49.847 |
| 0.48876157407407406 | 49.845 |
| 0.48877314814814815 | 49.846 |
| 0.4887847222222222 | 49.845 |
| 0.48879629629629634 | 49.845 |
| 0.4888078703703704 | 49.845 |
| 0.4888194444444445 | 49.846 |
| 0.4888310185185185 | 49.847 |
| 0.4888425925925926 | 49.846 |
| 0.48885416666666665 | 49.844 |
| 0.4888657407407408 | 49.842 |
| 0.48887731481481483 | 49.842 |
| 0.4888888888888889 | 49.841 |
| 0.48890046296296297 | 49.841 |
| 0.488912037037037 | 49.842 |
| 0.4889236111111111 | 49.841 |
| 0.48893518518518514 | 49.841 |
| 0.4889467592592593 | 49.84 |
| 0.48895833333333333 | 49.84 |
| 0.4889699074074074 | 49.838 |
| 0.48898148148148146 | 49.839 |
| 0.48899305555555556 | 49.836 |
| 0.4890046296296296 | 49.831 |
| 0.48901620370370374 | 49.828 |
| 0.4890277777777778 | 49.824 |
| 0.4890393518518519 | 49.823 |
| 0.4890509259259259 | 49.821 |
| 0.4890625 | 49.819 |
| 0.48907407407407405 | 49.817 |
| 0.4890856481481482 | 49.818 |
| 0.48909722222222224 | 49.82 |
| 0.48910879629629633 | 49.822 |
| 0.48912037037037037 | 49.82 |
| 0.4891319444444444 | 49.82 |
| 0.4891435185185185 | 49.82 |
| 0.48915509259259254 | 49.821 |
| 0.4891666666666667 | 49.82 |
| 0.48917824074074073 | 49.818 |
| 0.4891898148148148 | 49.817 |
| 0.48920138888888887 | 49.816 |
| 0.48921296296296296 | 49.818 |
| 0.489224537037037 | 49.816 |
| 0.48923611111111115 | 49.815 |
| 0.4892476851851852 | 49.82 |
| 0.4892592592592593 | 49.823 |
| 0.4892708333333333 | 49.829 |
| 0.4892824074074074 | 49.835 |
| 0.48929398148148145 | 49.838 |
| 0.4893055555555556 | 49.843 |
| 0.48931712962962964 | 49.847 |
| 0.48932870370370374 | 49.851 |
| 0.4893402777777778 | 49.853 |
| 0.4893518518518518 | 49.852 |
| 0.4893634259259259 | 49.852 |
| 0.48937499999999995 | 49.851 |
| 0.4893865740740741 | 49.851 |
| 0.48939814814814814 | 49.85 |
| 0.48940972222222223 | 49.849 |
| 0.48942129629629627 | 49.846 |
| 0.48943287037037037 | 49.846 |
| 0.4894444444444444 | 49.844 |
| 0.48945601851851855 | 49.842 |
| 0.4894675925925926 | 49.84 |
| 0.4894791666666667 | 49.835 |
| 0.4894907407407407 | 49.832 |
| 0.4895023148148148 | 49.83 |
| 0.48951388888888886 | 49.831 |
| 0.489525462962963 | 49.834 |
| 0.48953703703703705 | 49.837 |
| 0.48954861111111114 | 49.837 |
| 0.4895601851851852 | 49.837 |
| 0.4895717592592593 | 49.836 |
| 0.4895833333333333 | 49.835 |
| 0.48959490740740735 | 49.834 |
| 0.4896064814814815 | 49.832 |
| 0.48961805555555554 | 49.829 |
| 0.48962962962962964 | 49.828 |
| 0.4896412037037037 | 49.827 |
| 0.48965277777777777 | 49.829 |
| 0.4896643518518518 | 49.829 |
| 0.48967592592592596 | 49.832 |
| 0.4896875 | 49.833 |
| 0.4896990740740741 | 49.835 |
| 0.48971064814814813 | 49.837 |
| 0.4897222222222222 | 49.84 |
| 0.48973379629629626 | 49.843 |
| 0.4897453703703704 | 49.845 |
| 0.48975694444444445 | 49.847 |
| 0.48976851851851855 | 49.847 |
| 0.4897800925925926 | 49.846 |
| 0.4897916666666667 | 49.849 |
| 0.4898032407407407 | 49.851 |
| 0.48981481481481487 | 49.853 |
| 0.4898263888888889 | 49.854 |
| 0.48983796296296295 | 49.857 |
| 0.48984953703703704 | 49.859 |
| 0.4898611111111111 | 49.861 |
| 0.4898726851851852 | 49.862 |
| 0.4898842592592592 | 49.863 |
| 0.48989583333333336 | 49.866 |
| 0.4899074074074074 | 49.869 |
| 0.4899189814814815 | 49.872 |
| 0.48993055555555554 | 49.875 |
| 0.48994212962962963 | 49.876 |
| 0.48995370370370367 | 49.877 |
| 0.4899652777777778 | 49.879 |
| 0.48997685185185186 | 49.883 |
| 0.48998842592592595 | 49.889 |
| 0.49 | 49.893 |
| 0.4900115740740741 | 49.896 |
| 0.4900231481481481 | 49.902 |
| 0.4900347222222223 | 49.907 |
| 0.4900462962962963 | 49.908 |
| 0.49005787037037035 | 49.909 |
| 0.49006944444444445 | 49.91 |
| 0.4900810185185185 | 49.911 |
| 0.4900925925925926 | 49.912 |
| 0.4901041666666666 | 49.911 |
| 0.49011574074074077 | 49.909 |
| 0.4901273148148148 | 49.91 |
| 0.4901388888888889 | 49.911 |
| 0.49015046296296294 | 49.91 |
| 0.49016203703703703 | 49.909 |
| 0.4901736111111111 | 49.908 |
| 0.4901851851851852 | 49.907 |
| 0.49019675925925926 | 49.906 |
| 0.49020833333333336 | 49.903 |
| 0.4902199074074074 | 49.901 |
| 0.4902314814814815 | 49.899 |
| 0.49024305555555553 | 49.897 |
| 0.4902546296296297 | 49.899 |
| 0.4902662037037037 | 49.899 |
| 0.4902777777777778 | 49.899 |
| 0.49028935185185185 | 49.903 |
| 0.4903009259259259 | 49.903 |
| 0.4903125 | 49.904 |
| 0.490324074074074 | 49.903 |
| 0.4903356481481482 | 49.9 |
| 0.4903472222222222 | 49.901 |
| 0.4903587962962963 | 49.898 |
| 0.49037037037037035 | 49.895 |
| 0.49038194444444444 | 49.891 |
| 0.4903935185185185 | 49.889 |
| 0.49040509259259263 | 49.888 |
| 0.49041666666666667 | 49.887 |
| 0.49042824074074076 | 49.887 |
| 0.4904398148148148 | 49.884 |
| 0.4904513888888889 | 49.884 |
| 0.49046296296296293 | 49.886 |
| 0.4904745370370371 | 49.886 |
| 0.4904861111111111 | 49.888 |
| 0.4904976851851852 | 49.89 |
| 0.49050925925925926 | 49.89 |
| 0.49052083333333335 | 49.891 |
| 0.4905324074074074 | 49.89 |
| 0.49054398148148143 | 49.891 |
| 0.4905555555555556 | 49.892 |
| 0.4905671296296296 | 49.893 |
| 0.4905787037037037 | 49.895 |
| 0.49059027777777775 | 49.898 |
| 0.49060185185185184 | 49.899 |
| 0.4906134259259259 | 49.902 |
| 0.49062500000000003 | 49.903 |
| 0.49063657407407407 | 49.906 |
| 0.49064814814814817 | 49.908 |
| 0.4906597222222222 | 49.908 |
| 0.4906712962962963 | 49.909 |
| 0.49068287037037034 | 49.907 |
| 0.4906944444444445 | 49.905 |
| 0.4907060185185185 | 49.903 |
| 0.4907175925925926 | 49.899 |
| 0.49072916666666666 | 49.897 |
| 0.49074074074074076 | 49.896 |
| 0.4907523148148148 | 49.895 |
| 0.49076388888888894 | 49.894 |
| 0.490775462962963 | 49.893 |
| 0.490787037037037 | 49.894 |
| 0.4907986111111111 | 49.896 |
| 0.49081018518518515 | 49.897 |
| 0.49082175925925925 | 49.9 |
| 0.4908333333333333 | 49.904 |
| 0.49084490740740744 | 49.909 |
| 0.4908564814814815 | 49.914 |
| 0.49086805555555557 | 49.917 |
| 0.4908796296296296 | 49.919 |
| 0.4908912037037037 | 49.922 |
| 0.49090277777777774 | 49.924 |
| 0.4909143518518519 | 49.924 |
| 0.49092592592592593 | 49.926 |
| 0.4909375 | 49.926 |
| 0.49094907407407407 | 49.926 |
| 0.49096064814814816 | 49.926 |
| 0.4909722222222222 | 49.925 |
| 0.49098379629629635 | 49.924 |
| 0.4909953703703704 | 49.922 |
| 0.4910069444444444 | 49.92 |
| 0.4910185185185185 | 49.921 |
| 0.49103009259259256 | 49.921 |
| 0.49104166666666665 | 49.92 |
| 0.4910532407407407 | 49.92 |
| 0.49106481481481484 | 49.922 |
| 0.4910763888888889 | 49.923 |
| 0.491087962962963 | 49.923 |
| 0.491099537037037 | 49.923 |
| 0.4911111111111111 | 49.921 |
| 0.49112268518518515 | 49.921 |
| 0.4911342592592593 | 49.923 |
| 0.49114583333333334 | 49.924 |
| 0.49115740740740743 | 49.925 |
| 0.49116898148148147 | 49.923 |
| 0.49118055555555556 | 49.921 |
| 0.4911921296296296 | 49.92 |
| 0.49120370370370375 | 49.919 |
| 0.4912152777777778 | 49.918 |
| 0.4912268518518519 | 49.918 |
| 0.4912384259259259 | 49.918 |
| 0.49124999999999996 | 49.916 |
| 0.49126157407407406 | 49.915 |
| 0.4912731481481481 | 49.915 |
| 0.49128472222222225 | 49.915 |
| 0.4912962962962963 | 49.916 |
| 0.4913078703703704 | 49.916 |
| 0.4913194444444444 | 49.915 |
| 0.4913310185185185 | 49.914 |
| 0.49134259259259255 | 49.918 |
| 0.4913541666666667 | 49.918 |
| 0.49136574074074074 | 49.918 |
| 0.49137731481481484 | 49.917 |
| 0.4913888888888889 | 49.917 |
| 0.49140046296296297 | 49.914 |
| 0.491412037037037 | 49.911 |
| 0.49142361111111116 | 49.908 |
| 0.4914351851851852 | 49.907 |
| 0.4914467592592593 | 49.909 |
| 0.49145833333333333 | 49.91 |
| 0.4914699074074074 | 49.911 |
| 0.49148148148148146 | 49.913 |
| 0.4914930555555555 | 49.918 |
| 0.49150462962962965 | 49.92 |
| 0.4915162037037037 | 49.923 |
| 0.4915277777777778 | 49.923 |
| 0.4915393518518518 | 49.923 |
| 0.4915509259259259 | 49.925 |
| 0.49156249999999996 | 49.928 |
| 0.4915740740740741 | 49.932 |
| 0.49158564814814815 | 49.936 |
| 0.49159722222222224 | 49.938 |
| 0.4916087962962963 | 49.939 |
| 0.4916203703703704 | 49.938 |
| 0.4916319444444444 | 49.937 |
| 0.49164351851851856 | 49.94 |
| 0.4916550925925926 | 49.941 |
| 0.4916666666666667 | 49.938 |
| 0.49167824074074074 | 49.935 |
| 0.49168981481481483 | 49.932 |
| 0.49170138888888887 | 49.932 |
| 0.491712962962963 | 49.932 |
| 0.49172453703703706 | 49.93 |
| 0.4917361111111111 | 49.928 |
| 0.4917476851851852 | 49.926 |
| 0.49175925925925923 | 49.923 |
| 0.4917708333333333 | 49.922 |
| 0.49178240740740736 | 49.919 |
| 0.4917939814814815 | 49.915 |
| 0.49180555555555555 | 49.91 |
| 0.49181712962962965 | 49.906 |
| 0.4918287037037037 | 49.903 |
| 0.4918402777777778 | 49.902 |
| 0.4918518518518518 | 49.902 |
| 0.49186342592592597 | 49.903 |
| 0.491875 | 49.903 |
| 0.4918865740740741 | 49.907 |
| 0.49189814814814814 | 49.907 |
| 0.49190972222222223 | 49.908 |
| 0.4919212962962963 | 49.909 |
| 0.4919328703703704 | 49.911 |
| 0.49194444444444446 | 49.914 |
| 0.4919560185185185 | 49.915 |
| 0.4919675925925926 | 49.913 |
| 0.49197916666666663 | 49.913 |
| 0.49199074074074073 | 49.911 |
| 0.49200231481481477 | 49.912 |
| 0.4920138888888889 | 49.911 |
| 0.49202546296296296 | 49.913 |
| 0.49203703703703705 | 49.912 |
| 0.4920486111111111 | 49.912 |
| 0.4920601851851852 | 49.913 |
| 0.4920717592592592 | 49.914 |
| 0.4920833333333334 | 49.915 |
| 0.4920949074074074 | 49.914 |
| 0.4921064814814815 | 49.915 |
| 0.49211805555555554 | 49.917 |
| 0.49212962962962964 | 49.92 |
| 0.4921412037037037 | 49.925 |
| 0.49215277777777783 | 49.929 |
| 0.49216435185185187 | 49.932 |
| 0.49217592592592596 | 49.938 |
| 0.4921875 | 49.942 |
| 0.49219907407407404 | 49.947 |
| 0.49221064814814813 | 49.949 |
| 0.49222222222222217 | 49.951 |
| 0.4922337962962963 | 49.952 |
| 0.49224537037037036 | 49.953 |
| 0.49225694444444446 | 49.957 |
| 0.4922685185185185 | 49.959 |
| 0.4922800925925926 | 49.961 |
| 0.4922916666666666 | 49.964 |
| 0.4923032407407408 | 49.965 |
| 0.4923148148148148 | 49.967 |
| 0.4923263888888889 | 49.967 |
| 0.49233796296296295 | 49.969 |
| 0.49234953703703704 | 49.971 |
| 0.4923611111111111 | 49.974 |
| 0.49237268518518523 | 49.976 |
| 0.49238425925925927 | 49.976 |
| 0.49239583333333337 | 49.976 |
| 0.4924074074074074 | 49.976 |
| 0.4924189814814815 | 49.975 |
| 0.49243055555555554 | 49.975 |
| 0.4924421296296296 | 49.974 |
| 0.4924537037037037 | 49.975 |
| 0.49246527777777777 | 49.975 |
| 0.49247685185185186 | 49.976 |
| 0.4924884259259259 | 49.976 |
| 0.4925 | 49.978 |
| 0.49251157407407403 | 49.979 |
| 0.4925231481481482 | 49.981 |
| 0.4925347222222222 | 49.982 |
| 0.4925462962962963 | 49.984 |
| 0.49255787037037035 | 49.986 |
| 0.49256944444444445 | 49.987 |
| 0.4925810185185185 | 49.986 |
| 0.49259259259259264 | 49.986 |
| 0.4926041666666667 | 49.985 |
| 0.49261574074074077 | 49.984 |
| 0.4926273148148148 | 49.985 |
| 0.4926388888888889 | 49.985 |
| 0.49265046296296294 | 49.986 |
| 0.492662037037037 | 49.986 |
| 0.49267361111111113 | 49.986 |
| 0.49268518518518517 | 49.984 |
| 0.49269675925925926 | 49.983 |
| 0.4927083333333333 | 49.98 |
| 0.4927199074074074 | 49.979 |
| 0.49273148148148144 | 49.978 |
| 0.4927430555555556 | 49.976 |
| 0.4927546296296296 | 49.976 |
| 0.4927662037037037 | 49.978 |
| 0.49277777777777776 | 49.978 |
| 0.49278935185185185 | 49.979 |
| 0.4928009259259259 | 49.983 |
| 0.49281250000000004 | 49.985 |
| 0.4928240740740741 | 49.986 |
| 0.4928356481481482 | 49.987 |
| 0.4928472222222222 | 49.987 |
| 0.4928587962962963 | 49.987 |
| 0.49287037037037035 | 49.99 |
| 0.4928819444444445 | 49.99 |
| 0.49289351851851854 | 49.988 |
| 0.4929050925925926 | 49.987 |
| 0.49291666666666667 | 49.984 |
| 0.4929282407407407 | 49.983 |
| 0.4929398148148148 | 49.982 |
| 0.49295138888888884 | 49.979 |
| 0.492962962962963 | 49.976 |
| 0.49297453703703703 | 49.972 |
| 0.4929861111111111 | 49.971 |
| 0.49299768518518516 | 49.973 |
| 0.49300925925925926 | 49.975 |
| 0.4930208333333333 | 49.977 |
| 0.49303240740740745 | 49.976 |
| 0.4930439814814815 | 49.977 |
| 0.4930555555555556 | 49.975 |
| 0.4930671296296296 | 49.975 |
| 0.4930787037037037 | 49.973 |
| 0.49309027777777775 | 49.971 |
| 0.4931018518518519 | 49.97 |
| 0.49311342592592594 | 49.968 |
| 0.49312500000000004 | 49.964 |
| 0.4931365740740741 | 49.964 |
| 0.4931481481481481 | 49.963 |
| 0.4931597222222222 | 49.964 |
| 0.49317129629629625 | 49.965 |
| 0.4931828703703704 | 49.961 |
| 0.49319444444444444 | 49.96 |
| 0.49320601851851853 | 49.96 |
| 0.49321759259259257 | 49.956 |
| 0.49322916666666666 | 49.954 |
| 0.4932407407407407 | 49.951 |
| 0.49325231481481485 | 49.947 |
| 0.4932638888888889 | 49.944 |
| 0.493275462962963 | 49.943 |
| 0.493287037037037 | 49.943 |
| 0.4932986111111111 | 49.945 |
| 0.49331018518518516 | 49.947 |
| 0.4933217592592593 | 49.949 |
| 0.49333333333333335 | 49.953 |
| 0.49334490740740744 | 49.957 |
| 0.4933564814814815 | 49.961 |
| 0.4933680555555556 | 49.964 |
| 0.4933796296296296 | 49.965 |
| 0.49339120370370365 | 49.967 |
| 0.4934027777777778 | 49.968 |
| 0.49341435185185184 | 49.968 |
| 0.49342592592592593 | 49.967 |
| 0.4934375 | 49.966 |
| 0.49344907407407407 | 49.966 |
| 0.4934606481481481 | 49.966 |
| 0.49347222222222226 | 49.965 |
| 0.4934837962962963 | 49.963 |
| 0.4934953703703704 | 49.962 |
| 0.49350694444444443 | 49.961 |
| 0.4935185185185185 | 49.958 |
| 0.49353009259259256 | 49.956 |
| 0.4935416666666667 | 49.955 |
| 0.49355324074074075 | 49.953 |
| 0.49356481481481485 | 49.952 |
| 0.4935763888888889 | 49.951 |
| 0.493587962962963 | 49.95 |
| 0.493599537037037 | 49.948 |
| 0.49361111111111106 | 49.947 |
| 0.4936226851851852 | 49.946 |
| 0.49363425925925924 | 49.946 |
| 0.49364583333333334 | 49.946 |
| 0.4936574074074074 | 49.943 |
| 0.4936689814814815 | 49.944 |
| 0.4936805555555555 | 49.943 |
| 0.49369212962962966 | 49.944 |
| 0.4937037037037037 | 49.947 |
| 0.4937152777777778 | 49.952 |
| 0.49372685185185183 | 49.953 |
| 0.49373842592592593 | 49.956 |
| 0.49374999999999997 | 49.955 |
| 0.4937615740740741 | 49.956 |
| 0.49377314814814816 | 49.954 |
| 0.49378472222222225 | 49.954 |
| 0.4937962962962963 | 49.953 |
| 0.4938078703703704 | 49.952 |
| 0.4938194444444444 | 49.953 |
| 0.49383101851851857 | 49.956 |
| 0.4938425925925926 | 49.958 |
| 0.49385416666666665 | 49.96 |
| 0.49386574074074074 | 49.962 |
| 0.4938773148148148 | 49.964 |
| 0.4938888888888889 | 49.966 |
| 0.4939004629629629 | 49.967 |
| 0.49391203703703707 | 49.968 |
| 0.4939236111111111 | 49.97 |
| 0.4939351851851852 | 49.972 |
| 0.49394675925925924 | 49.975 |
| 0.49395833333333333 | 49.976 |
| 0.49396990740740737 | 49.976 |
| 0.4939814814814815 | 49.974 |
| 0.49399305555555556 | 49.975 |
| 0.49400462962962965 | 49.976 |
| 0.4940162037037037 | 49.978 |
| 0.4940277777777778 | 49.98 |
| 0.4940393518518518 | 49.982 |
| 0.494050925925926 | 49.98 |
| 0.4940625 | 49.982 |
| 0.4940740740740741 | 49.982 |
| 0.49408564814814815 | 49.98 |
| 0.4940972222222222 | 49.978 |
| 0.4941087962962963 | 49.977 |
| 0.4941203703703703 | 49.976 |
| 0.49413194444444447 | 49.975 |
| 0.4941435185185185 | 49.973 |
| 0.4941550925925926 | 49.972 |
| 0.49416666666666664 | 49.97 |
| 0.49417824074074074 | 49.972 |
| 0.4941898148148148 | 49.975 |
| 0.4942013888888889 | 49.976 |
| 0.49421296296296297 | 49.973 |
| 0.49422453703703706 | 49.974 |
| 0.4942361111111111 | 49.973 |
| 0.4942476851851852 | 49.971 |
| 0.49425925925925923 | 49.968 |
| 0.4942708333333334 | 49.965 |
| 0.4942824074074074 | 49.962 |
| 0.4942939814814815 | 49.961 |
| 0.49430555555555555 | 49.961 |
| 0.49431712962962965 | 49.962 |
| 0.4943287037037037 | 49.961 |
| 0.4943402777777777 | 49.961 |
| 0.4943518518518519 | 49.962 |
| 0.4943634259259259 | 49.96 |
| 0.494375 | 49.958 |
| 0.49438657407407405 | 49.955 |
| 0.49439814814814814 | 49.952 |
| 0.4944097222222222 | 49.948 |
| 0.49442129629629633 | 49.945 |
| 0.49443287037037037 | 49.942 |
| 0.49444444444444446 | 49.939 |
| 0.4944560185185185 | 49.94 |
| 0.4944675925925926 | 49.942 |
| 0.49447916666666664 | 49.943 |
| 0.4944907407407408 | 49.943 |
| 0.4945023148148148 | 49.943 |
| 0.4945138888888889 | 49.943 |
| 0.49452546296296296 | 49.941 |
| 0.49453703703703705 | 49.939 |
| 0.4945486111111111 | 49.937 |
| 0.49456018518518513 | 49.934 |
| 0.4945717592592593 | 49.935 |
| 0.4945833333333333 | 49.936 |
| 0.4945949074074074 | 49.935 |
| 0.49460648148148145 | 49.935 |
| 0.49461805555555555 | 49.937 |
| 0.4946296296296296 | 49.936 |
| 0.49464120370370374 | 49.939 |
| 0.4946527777777778 | 49.942 |
| 0.49466435185185187 | 49.946 |
| 0.4946759259259259 | 49.95 |
| 0.4946875 | 49.953 |
| 0.49469907407407404 | 49.955 |
| 0.4947106481481482 | 49.956 |
| 0.49472222222222223 | 49.956 |
| 0.4947337962962963 | 49.956 |
| 0.49474537037037036 | 49.958 |
| 0.49475694444444446 | 49.958 |
| 0.4947685185185185 | 49.955 |
| 0.49478009259259265 | 49.955 |
| 0.4947916666666667 | 49.953 |
| 0.4948032407407407 | 49.949 |
| 0.4948148148148148 | 49.946 |
| 0.49482638888888886 | 49.941 |
| 0.49483796296296295 | 49.937 |
| 0.494849537037037 | 49.932 |
| 0.49486111111111114 | 49.932 |
| 0.4948726851851852 | 49.928 |
| 0.4948842592592593 | 49.927 |
| 0.4948958333333333 | 49.927 |
| 0.4949074074074074 | 49.927 |
| 0.49491898148148145 | 49.927 |
| 0.4949305555555556 | 49.929 |
| 0.49494212962962963 | 49.932 |
| 0.49495370370370373 | 49.936 |
| 0.49496527777777777 | 49.94 |
| 0.49497685185185186 | 49.943 |
| 0.4949884259259259 | 49.947 |
| 0.49500000000000005 | 49.949 |
| 0.4950115740740741 | 49.95 |
| 0.4950231481481482 | 49.951 |
| 0.4950347222222222 | 49.952 |
| 0.49504629629629626 | 49.953 |
| 0.49505787037037036 | 49.953 |
| 0.4950694444444444 | 49.955 |
| 0.49508101851851855 | 49.959 |
| 0.4950925925925926 | 49.961 |
| 0.4951041666666667 | 49.962 |
| 0.4951157407407407 | 49.961 |
| 0.4951273148148148 | 49.961 |
| 0.49513888888888885 | 49.96 |
| 0.495150462962963 | 49.959 |
| 0.49516203703703704 | 49.959 |
| 0.49517361111111113 | 49.96 |
| 0.4951851851851852 | 49.96 |
| 0.49519675925925927 | 49.957 |
| 0.4952083333333333 | 49.959 |
| 0.49521990740740746 | 49.957 |
| 0.4952314814814815 | 49.955 |
| 0.4952430555555556 | 49.952 |
| 0.49525462962962963 | 49.951 |
| 0.49526620370370367 | 49.95 |
| 0.49527777777777776 | 49.946 |
| 0.4952893518518518 | 49.944 |
| 0.49530092592592595 | 49.943 |
| 0.4953125 | 49.943 |
| 0.4953240740740741 | 49.943 |
| 0.4953356481481481 | 49.941 |
| 0.4953472222222222 | 49.938 |
| 0.49535879629629626 | 49.932 |
| 0.4953703703703704 | 49.929 |
| 0.49538194444444444 | 49.927 |
| 0.49539351851851854 | 49.922 |
| 0.4954050925925926 | 49.919 |
| 0.49541666666666667 | 49.913 |
| 0.4954282407407407 | 49.909 |
| 0.49543981481481486 | 49.908 |
| 0.4954513888888889 | 49.908 |
| 0.495462962962963 | 49.907 |
| 0.49547453703703703 | 49.905 |
| 0.4954861111111111 | 49.904 |
| 0.49549768518518517 | 49.903 |
| 0.4955092592592592 | 49.903 |
| 0.49552083333333335 | 49.902 |
| 0.4955324074074074 | 49.902 |
| 0.4955439814814815 | 49.904 |
| 0.4955555555555555 | 49.904 |
| 0.4955671296296296 | 49.904 |
| 0.49557870370370366 | 49.906 |
| 0.4955902777777778 | 49.91 |
| 0.49560185185185185 | 49.912 |
| 0.49561342592592594 | 49.915 |
| 0.495625 | 49.913 |
| 0.4956365740740741 | 49.914 |
| 0.4956481481481481 | 49.914 |
| 0.49565972222222227 | 49.914 |
| 0.4956712962962963 | 49.912 |
| 0.4956828703703704 | 49.909 |
| 0.49569444444444444 | 49.906 |
| 0.49570601851851853 | 49.903 |
| 0.49571759259259257 | 49.901 |
| 0.4957291666666667 | 49.899 |
| 0.49574074074074076 | 49.899 |
| 0.4957523148148148 | 49.901 |
| 0.4957638888888889 | 49.904 |
| 0.49577546296296293 | 49.908 |
| 0.495787037037037 | 49.91 |
| 0.49579861111111106 | 49.911 |
| 0.4958101851851852 | 49.913 |
| 0.49582175925925925 | 49.916 |
| 0.49583333333333335 | 49.918 |
| 0.4958449074074074 | 49.917 |
| 0.4958564814814815 | 49.915 |
| 0.4958680555555555 | 49.913 |
| 0.49587962962962967 | 49.91 |
| 0.4958912037037037 | 49.912 |
| 0.4959027777777778 | 49.911 |
| 0.49591435185185184 | 49.911 |
| 0.49592592592592594 | 49.911 |
| 0.4959375 | 49.913 |
| 0.4959490740740741 | 49.917 |
| 0.49596064814814816 | 49.924 |
| 0.49597222222222226 | 49.927 |
| 0.4959837962962963 | 49.933 |
| 0.49599537037037034 | 49.936 |
| 0.49600694444444443 | 49.94 |
| 0.49601851851851847 | 49.945 |
| 0.4960300925925926 | 49.949 |
| 0.49604166666666666 | 49.951 |
| 0.49605324074074075 | 49.953 |
| 0.4960648148148148 | 49.956 |
| 0.4960763888888889 | 49.957 |
| 0.4960879629629629 | 49.958 |
| 0.4960995370370371 | 49.96 |
| 0.4961111111111111 | 49.961 |
| 0.4961226851851852 | 49.962 |
| 0.49613425925925925 | 49.961 |
| 0.49614583333333334 | 49.96 |
| 0.4961574074074074 | 49.958 |
| 0.49616898148148153 | 49.957 |
| 0.49618055555555557 | 49.955 |
| 0.49619212962962966 | 49.951 |
| 0.4962037037037037 | 49.948 |
| 0.49621527777777774 | 49.945 |
| 0.49622685185185184 | 49.942 |
| 0.4962384259259259 | 49.94 |
| 0.49625 | 49.94 |
| 0.49626157407407406 | 49.938 |
| 0.49627314814814816 | 49.939 |
| 0.4962847222222222 | 49.94 |
| 0.4962962962962963 | 49.943 |
| 0.49630787037037033 | 49.943 |
| 0.4963194444444445 | 49.943 |
| 0.4963310185185185 | 49.943 |
| 0.4963425925925926 | 49.945 |
| 0.49635416666666665 | 49.947 |
| 0.49636574074074075 | 49.947 |
| 0.4963773148148148 | 49.945 |
| 0.49638888888888894 | 49.946 |
| 0.496400462962963 | 49.945 |
| 0.49641203703703707 | 49.943 |
| 0.4964236111111111 | 49.943 |
| 0.4964351851851852 | 49.942 |
| 0.49644675925925924 | 49.942 |
| 0.4964583333333333 | 49.942 |
| 0.49646990740740743 | 49.944 |
| 0.49648148148148147 | 49.943 |
| 0.49649305555555556 | 49.943 |
| 0.4965046296296296 | 49.941 |
| 0.4965162037037037 | 49.939 |
| 0.49652777777777773 | 49.938 |
| 0.4965393518518519 | 49.936 |
| 0.4965509259259259 | 49.934 |
| 0.4965625 | 49.93 |
| 0.49657407407407406 | 49.928 |
| 0.49658564814814815 | 49.924 |
| 0.4965972222222222 | 49.92 |
| 0.49660879629629634 | 49.919 |
| 0.4966203703703704 | 49.916 |
| 0.4966319444444445 | 49.916 |
| 0.4966435185185185 | 49.919 |
| 0.4966550925925926 | 49.919 |
| 0.49666666666666665 | 49.922 |
| 0.4966782407407408 | 49.923 |
| 0.49668981481481483 | 49.926 |
| 0.4967013888888889 | 49.929 |
| 0.49671296296296297 | 49.932 |
| 0.496724537037037 | 49.932 |
| 0.4967361111111111 | 49.932 |
| 0.49674768518518514 | 49.931 |
| 0.4967592592592593 | 49.93 |
| 0.49677083333333333 | 49.932 |
| 0.4967824074074074 | 49.932 |
| 0.49679398148148146 | 49.934 |
| 0.49680555555555556 | 49.934 |
| 0.4968171296296296 | 49.933 |
| 0.49682870370370374 | 49.934 |
| 0.4968402777777778 | 49.934 |
| 0.4968518518518519 | 49.933 |
| 0.4968634259259259 | 49.932 |
| 0.496875 | 49.931 |
| 0.49688657407407405 | 49.928 |
| 0.4968981481481482 | 49.923 |
| 0.49690972222222224 | 49.92 |
| 0.49692129629629633 | 49.916 |
| 0.49693287037037037 | 49.914 |
| 0.4969444444444444 | 49.912 |
| 0.4969560185185185 | 49.911 |
| 0.49696759259259254 | 49.912 |
| 0.4969791666666667 | 49.911 |
| 0.49699074074074073 | 49.911 |
| 0.4970023148148148 | 49.912 |
| 0.49701388888888887 | 49.909 |
| 0.49702546296296296 | 49.909 |
| 0.497037037037037 | 49.91 |
| 0.49704861111111115 | 49.91 |
| 0.4970601851851852 | 49.911 |
| 0.4970717592592593 | 49.913 |
| 0.4970833333333333 | 49.919 |
| 0.4970949074074074 | 49.919 |
| 0.49710648148148145 | 49.921 |
| 0.4971180555555556 | 49.923 |
| 0.49712962962962964 | 49.924 |
| 0.49714120370370374 | 49.926 |
| 0.4971527777777778 | 49.928 |
| 0.4971643518518518 | 49.932 |
| 0.4971759259259259 | 49.934 |
| 0.49718749999999995 | 49.933 |
| 0.4971990740740741 | 49.932 |
| 0.49721064814814814 | 49.93 |
| 0.49722222222222223 | 49.928 |
| 0.49723379629629627 | 49.927 |
| 0.49724537037037037 | 49.926 |
| 0.4972569444444444 | 49.928 |
| 0.49726851851851855 | 49.93 |
| 0.4972800925925926 | 49.93 |
| 0.4972916666666667 | 49.934 |
| 0.4973032407407407 | 49.935 |
| 0.4973148148148148 | 49.938 |
| 0.49732638888888886 | 49.937 |
| 0.497337962962963 | 49.938 |
| 0.49734953703703705 | 49.938 |
| 0.49736111111111114 | 49.936 |
| 0.4973726851851852 | 49.934 |
| 0.4973842592592593 | 49.934 |
| 0.4973958333333333 | 49.934 |
| 0.49740740740740735 | 49.933 |
| 0.4974189814814815 | 49.935 |
| 0.49743055555555554 | 49.933 |
| 0.49744212962962964 | 49.934 |
| 0.4974537037037037 | 49.936 |
| 0.49746527777777777 | 49.936 |
| 0.4974768518518518 | 49.939 |
| 0.49748842592592596 | 49.942 |
| 0.4975 | 49.944 |
| 0.4975115740740741 | 49.946 |
| 0.49752314814814813 | 49.95 |
| 0.4975347222222222 | 49.951 |
| 0.49754629629629626 | 49.951 |
| 0.4975578703703704 | 49.949 |
| 0.49756944444444445 | 49.948 |
| 0.49758101851851855 | 49.949 |
| 0.4975925925925926 | 49.95 |
| 0.4976041666666667 | 49.954 |
| 0.4976157407407407 | 49.959 |
| 0.49762731481481487 | 49.961 |
| 0.4976388888888889 | 49.964 |
| 0.49765046296296295 | 49.969 |
| 0.49766203703703704 | 49.97 |
| 0.4976736111111111 | 49.975 |
| 0.4976851851851852 | 49.976 |
| 0.4976967592592592 | 49.977 |
| 0.49770833333333336 | 49.978 |
| 0.4977199074074074 | 49.978 |
| 0.4977314814814815 | 49.978 |
| 0.49774305555555554 | 49.98 |
| 0.49775462962962963 | 49.981 |
| 0.49776620370370367 | 49.981 |
| 0.4977777777777778 | 49.98 |
| 0.49778935185185186 | 49.98 |
| 0.49780092592592595 | 49.978 |
| 0.4978125 | 49.976 |
| 0.4978240740740741 | 49.974 |
| 0.4978356481481481 | 49.972 |
| 0.4978472222222223 | 49.972 |
| 0.4978587962962963 | 49.97 |
| 0.49787037037037035 | 49.97 |
| 0.49788194444444445 | 49.97 |
| 0.4978935185185185 | 49.969 |
| 0.4979050925925926 | 49.968 |
| 0.4979166666666666 | 49.966 |
| 0.49792824074074077 | 49.964 |
| 0.4979398148148148 | 49.965 |
| 0.4979513888888889 | 49.963 |
| 0.49796296296296294 | 49.962 |
| 0.49797453703703703 | 49.963 |
| 0.4979861111111111 | 49.965 |
| 0.4979976851851852 | 49.963 |
| 0.49800925925925926 | 49.963 |
| 0.49802083333333336 | 49.962 |
| 0.4980324074074074 | 49.961 |
| 0.4980439814814815 | 49.961 |
| 0.49805555555555553 | 49.962 |
| 0.4980671296296297 | 49.965 |
| 0.4980787037037037 | 49.967 |
| 0.4980902777777778 | 49.969 |
| 0.49810185185185185 | 49.97 |
| 0.4981134259259259 | 49.97 |
| 0.498125 | 49.968 |
| 0.498136574074074 | 49.966 |
| 0.4981481481481482 | 49.963 |
| 0.4981597222222222 | 49.96 |
| 0.4981712962962963 | 49.959 |
| 0.49818287037037035 | 49.953 |
| 0.49819444444444444 | 49.95 |
| 0.4982060185185185 | 49.946 |
| 0.49821759259259263 | 49.942 |
| 0.49822916666666667 | 49.939 |
| 0.49824074074074076 | 49.935 |
| 0.4982523148148148 | 49.932 |
| 0.4982638888888889 | 49.931 |
| 0.49827546296296293 | 49.93 |
| 0.4982870370370371 | 49.929 |
| 0.4982986111111111 | 49.926 |
| 0.4983101851851852 | 49.924 |
| 0.49832175925925926 | 49.921 |
| 0.49833333333333335 | 49.92 |
| 0.4983449074074074 | 49.92 |
| 0.49835648148148143 | 49.921 |
| 0.4983680555555556 | 49.921 |
| 0.4983796296296296 | 49.921 |
| 0.4983912037037037 | 49.922 |
| 0.49840277777777775 | 49.922 |
| 0.49841435185185184 | 49.922 |
| 0.4984259259259259 | 49.922 |
| 0.49843750000000003 | 49.921 |
| 0.49844907407407407 | 49.919 |
| 0.49846064814814817 | 49.916 |
| 0.4984722222222222 | 49.915 |
| 0.4984837962962963 | 49.914 |
| 0.49849537037037034 | 49.913 |
| 0.4985069444444445 | 49.912 |
| 0.4985185185185185 | 49.915 |
| 0.4985300925925926 | 49.916 |
| 0.49854166666666666 | 49.919 |
| 0.49855324074074076 | 49.92 |
| 0.4985648148148148 | 49.921 |
| 0.49857638888888894 | 49.921 |
| 0.498587962962963 | 49.921 |
| 0.498599537037037 | 49.922 |
| 0.4986111111111111 | 49.917 |
| 0.49862268518518515 | 49.914 |
| 0.49863425925925925 | 49.911 |
| 0.4986458333333333 | 49.907 |
| 0.49865740740740744 | 49.904 |
| 0.4986689814814815 | 49.902 |
| 0.49868055555555557 | 49.899 |
| 0.4986921296296296 | 49.898 |
| 0.4987037037037037 | 49.895 |
| 0.49871527777777774 | 49.892 |
| 0.4987268518518519 | 49.889 |
| 0.49873842592592593 | 49.889 |
| 0.49875 | 49.888 |
| 0.49876157407407407 | 49.885 |
| 0.49877314814814816 | 49.884 |
| 0.4987847222222222 | 49.885 |
| 0.49879629629629635 | 49.888 |
| 0.4988078703703704 | 49.891 |
| 0.4988194444444444 | 49.893 |
| 0.4988310185185185 | 49.898 |
| 0.49884259259259256 | 49.901 |
| 0.49885416666666665 | 49.902 |
| 0.4988657407407407 | 49.902 |
| 0.49887731481481484 | 49.903 |
| 0.4988888888888889 | 49.903 |
| 0.498900462962963 | 49.903 |
| 0.498912037037037 | 49.905 |
| 0.4989236111111111 | 49.905 |
| 0.49893518518518515 | 49.906 |
| 0.4989467592592593 | 49.906 |
| 0.49895833333333334 | 49.911 |
| 0.49896990740740743 | 49.914 |
| 0.49898148148148147 | 49.917 |
| 0.49899305555555556 | 49.919 |
| 0.4990046296296296 | 49.921 |
| 0.49901620370370375 | 49.918 |
| 0.4990277777777778 | 49.914 |
| 0.4990393518518519 | 49.912 |
| 0.4990509259259259 | 49.908 |
| 0.49906249999999996 | 49.906 |
| 0.49907407407407406 | 49.907 |
| 0.4990856481481481 | 49.909 |
| 0.49909722222222225 | 49.91 |
| 0.4991087962962963 | 49.911 |
| 0.4991203703703704 | 49.911 |
| 0.4991319444444444 | 49.912 |
| 0.4991435185185185 | 49.912 |
| 0.49915509259259255 | 49.912 |
| 0.4991666666666667 | 49.912 |
| 0.49917824074074074 | 49.915 |
| 0.49918981481481484 | 49.92 |
| 0.4992013888888889 | 49.923 |
| 0.49921296296296297 | 49.926 |
| 0.499224537037037 | 49.929 |
| 0.49923611111111116 | 49.931 |
| 0.4992476851851852 | 49.932 |
| 0.4992592592592593 | 49.933 |
| 0.49927083333333333 | 49.936 |
| 0.4992824074074074 | 49.937 |
| 0.49929398148148146 | 49.938 |
| 0.4993055555555555 | 49.937 |
| 0.49931712962962965 | 49.938 |
| 0.4993287037037037 | 49.936 |
| 0.4993402777777778 | 49.937 |
| 0.4993518518518518 | 49.94 |
| 0.4993634259259259 | 49.94 |
| 0.49937499999999996 | 49.941 |
| 0.4993865740740741 | 49.94 |
| 0.49939814814814815 | 49.938 |
| 0.49940972222222224 | 49.934 |
| 0.4994212962962963 | 49.931 |
| 0.4994328703703704 | 49.931 |
| 0.4994444444444444 | 49.929 |
| 0.49945601851851856 | 49.928 |
| 0.4994675925925926 | 49.928 |
| 0.4994791666666667 | 49.928 |
| 0.49949074074074074 | 49.928 |
| 0.49950231481481483 | 49.929 |
| 0.49951388888888887 | 49.93 |
| 0.499525462962963 | 49.931 |
| 0.49953703703703706 | 49.931 |
| 0.4995486111111111 | 49.932 |
| 0.4995601851851852 | 49.932 |
| 0.49957175925925923 | 49.931 |
| 0.4995833333333333 | 49.93 |
| 0.49959490740740736 | 49.929 |
| 0.4996064814814815 | 49.929 |
| 0.49961805555555555 | 49.93 |
| 0.49962962962962965 | 49.931 |
| 0.4996412037037037 | 49.93 |
| 0.4996527777777778 | 49.931 |
| 0.4996643518518518 | 49.932 |
| 0.49967592592592597 | 49.933 |
| 0.4996875 | 49.936 |
| 0.4996990740740741 | 49.938 |
| 0.49971064814814814 | 49.942 |
| 0.49972222222222223 | 49.944 |
| 0.4997337962962963 | 49.945 |
| 0.4997453703703704 | 49.945 |
| 0.49975694444444446 | 49.944 |
| 0.4997685185185185 | 49.943 |
| 0.4997800925925926 | 49.943 |
| 0.49979166666666663 | 49.941 |
| 0.49980324074074073 | 49.94 |
| 0.49981481481481477 | 49.94 |
| 0.4998263888888889 | 49.942 |
| 0.49983796296296296 | 49.942 |
| 0.49984953703703705 | 49.941 |
| 0.4998611111111111 | 49.942 |
| 0.4998726851851852 | 49.944 |
| 0.4998842592592592 | 49.945 |
| 0.4998958333333334 | 49.947 |
| 0.4999074074074074 | 49.946 |
| 0.4999189814814815 | 49.945 |
| 0.49993055555555554 | 49.943 |
| 0.49994212962962964 | 49.941 |
| 0.4999537037037037 | 49.938 |
| 0.49996527777777783 | 49.935 |
| 0.49997685185185187 | 49.933 |
| 0.49998842592592596 | 49.929 |
| 0.5 | 49.925 |
| 0.500011574074074 | 49.922 |
| 0.5000231481481482 | 49.92 |
| 0.5000347222222222 | 49.918 |
| 0.5000462962962963 | 49.921 |
| 0.5000578703703703 | 49.925 |
| 0.5000694444444445 | 49.929 |
| 0.5000810185185185 | 49.934 |
| 0.5000925925925926 | 49.938 |
| 0.5001041666666667 | 49.939 |
| 0.5001157407407407 | 49.94 |
| 0.5001273148148148 | 49.944 |
| 0.5001388888888889 | 49.947 |
| 0.500150462962963 | 49.951 |
| 0.5001620370370371 | 49.956 |
| 0.5001736111111111 | 49.959 |
| 0.5001851851851852 | 49.96 |
| 0.5001967592592592 | 49.962 |
| 0.5002083333333334 | 49.963 |
| 0.5002199074074074 | 49.961 |
| 0.5002314814814816 | 49.96 |
| 0.5002430555555556 | 49.957 |
| 0.5002546296296296 | 49.955 |
| 0.5002662037037037 | 49.95 |
| 0.5002777777777777 | 49.948 |
| 0.5002893518518519 | 49.943 |
| 0.5003009259259259 | 49.943 |
| 0.5003125 | 49.943 |
| 0.5003240740740741 | 49.945 |
| 0.5003356481481481 | 49.946 |
| 0.5003472222222222 | 49.947 |
| 0.5003587962962963 | 49.947 |
| 0.5003703703703704 | 49.946 |
| 0.5003819444444445 | 49.944 |
| 0.5003935185185185 | 49.941 |
| 0.5004050925925926 | 49.937 |
| 0.5004166666666666 | 49.935 |
| 0.5004282407407408 | 49.935 |
| 0.5004398148148148 | 49.936 |
| 0.500451388888889 | 49.937 |
| 0.500462962962963 | 49.937 |
| 0.500474537037037 | 49.939 |
| 0.5004861111111111 | 49.941 |
| 0.5004976851851851 | 49.942 |
| 0.5005092592592593 | 49.944 |
| 0.5005208333333333 | 49.945 |
| 0.5005324074074075 | 49.947 |
| 0.5005439814814815 | 49.948 |
| 0.5005555555555555 | 49.949 |
| 0.5005671296296296 | 49.95 |
| 0.5005787037037037 | 49.952 |
| 0.5005902777777778 | 49.953 |
| 0.5006018518518519 | 49.954 |
| 0.500613425925926 | 49.957 |
| 0.500625 | 49.959 |
| 0.500636574074074 | 49.96 |
| 0.5006481481481482 | 49.962 |
| 0.5006597222222222 | 49.961 |
| 0.5006712962962964 | 49.957 |
| 0.5006828703703704 | 49.957 |
| 0.5006944444444444 | 49.956 |
| 0.5007060185185185 | 49.955 |
| 0.5007175925925925 | 49.956 |
| 0.5007291666666667 | 49.956 |
| 0.5007407407407407 | 49.957 |
| 0.5007523148148149 | 49.96 |
| 0.5007638888888889 | 49.961 |
| 0.5007754629629629 | 49.964 |
| 0.500787037037037 | 49.963 |
| 0.5007986111111111 | 49.962 |
| 0.5008101851851852 | 49.962 |
| 0.5008217592592593 | 49.96 |
| 0.5008333333333334 | 49.959 |
| 0.5008449074074074 | 49.96 |
| 0.5008564814814814 | 49.958 |
| 0.5008680555555556 | 49.956 |
| 0.5008796296296296 | 49.954 |
| 0.5008912037037038 | 49.952 |
| 0.5009027777777778 | 49.95 |
| 0.5009143518518518 | 49.948 |
| 0.5009259259259259 | 49.946 |
| 0.5009375 | 49.943 |
| 0.5009490740740741 | 49.941 |
| 0.5009606481481481 | 49.939 |
| 0.5009722222222223 | 49.939 |
| 0.5009837962962963 | 49.937 |
| 0.5009953703703703 | 49.938 |
| 0.5010069444444444 | 49.939 |
| 0.5010185185185185 | 49.939 |
| 0.5010300925925926 | 49.938 |
| 0.5010416666666667 | 49.937 |
| 0.5010532407407408 | 49.935 |
| 0.5010648148148148 | 49.934 |
| 0.5010763888888888 | 49.933 |
| 0.501087962962963 | 49.933 |
| 0.501099537037037 | 49.931 |
| 0.5011111111111112 | 49.93 |
| 0.5011226851851852 | 49.931 |
| 0.5011342592592593 | 49.929 |
| 0.5011458333333333 | 49.927 |
| 0.5011574074074074 | 49.923 |
| 0.5011689814814815 | 49.92 |
| 0.5011805555555556 | 49.919 |
| 0.5011921296296297 | 49.917 |
| 0.5012037037037037 | 49.916 |
| 0.5012152777777777 | 49.914 |
| 0.5012268518518518 | 49.915 |
| 0.5012384259259259 | 49.916 |
| 0.50125 | 49.917 |
| 0.5012615740740741 | 49.918 |
| 0.5012731481481482 | 49.918 |
| 0.5012847222222222 | 49.918 |
| 0.5012962962962962 | 49.918 |
| 0.5013078703703704 | 49.916 |
| 0.5013194444444444 | 49.915 |
| 0.5013310185185186 | 49.913 |
| 0.5013425925925926 | 49.91 |
| 0.5013541666666667 | 49.908 |
| 0.5013657407407407 | 49.906 |
| 0.5013773148148148 | 49.902 |
| 0.5013888888888889 | 49.898 |
| 0.501400462962963 | 49.896 |
| 0.5014120370370371 | 49.893 |
| 0.5014236111111111 | 49.893 |
| 0.5014351851851852 | 49.892 |
| 0.5014467592592592 | 49.891 |
| 0.5014583333333333 | 49.891 |
| 0.5014699074074074 | 49.889 |
| 0.5014814814814815 | 49.887 |
| 0.5014930555555556 | 49.885 |
| 0.5015046296296296 | 49.882 |
| 0.5015162037037036 | 49.882 |
| 0.5015277777777778 | 49.881 |
| 0.5015393518518518 | 49.88 |
| 0.501550925925926 | 49.881 |
| 0.5015625 | 49.883 |
| 0.5015740740740741 | 49.882 |
| 0.5015856481481481 | 49.882 |
| 0.5015972222222222 | 49.882 |
| 0.5016087962962963 | 49.883 |
| 0.5016203703703704 | 49.886 |
| 0.5016319444444445 | 49.887 |
| 0.5016435185185185 | 49.888 |
| 0.5016550925925926 | 49.888 |
| 0.5016666666666666 | 49.89 |
| 0.5016782407407407 | 49.89 |
| 0.5016898148148148 | 49.892 |
| 0.5017013888888889 | 49.895 |
| 0.501712962962963 | 49.896 |
| 0.501724537037037 | 49.897 |
| 0.501736111111111 | 49.896 |
| 0.5017476851851852 | 49.895 |
| 0.5017592592592592 | 49.893 |
| 0.5017708333333334 | 49.891 |
| 0.5017824074074074 | 49.888 |
| 0.5017939814814815 | 49.885 |
| 0.5018055555555555 | 49.881 |
| 0.5018171296296297 | 49.877 |
| 0.5018287037037037 | 49.874 |
| 0.5018402777777778 | 49.872 |
| 0.5018518518518519 | 49.871 |
| 0.5018634259259259 | 49.872 |
| 0.501875 | 49.872 |
| 0.5018865740740741 | 49.873 |
| 0.5018981481481481 | 49.873 |
| 0.5019097222222222 | 49.875 |
| 0.5019212962962963 | 49.874 |
| 0.5019328703703704 | 49.876 |
| 0.5019444444444444 | 49.877 |
| 0.5019560185185185 | 49.877 |
| 0.5019675925925926 | 49.875 |
| 0.5019791666666666 | 49.874 |
| 0.5019907407407408 | 49.873 |
| 0.5020023148148148 | 49.875 |
| 0.5020138888888889 | 49.877 |
| 0.5020254629629629 | 49.879 |
| 0.5020370370370371 | 49.882 |
| 0.5020486111111111 | 49.884 |
| 0.5020601851851852 | 49.889 |
| 0.5020717592592593 | 49.893 |
| 0.5020833333333333 | 49.895 |
| 0.5020949074074074 | 49.896 |
| 0.5021064814814815 | 49.896 |
| 0.5021180555555556 | 49.895 |
| 0.5021296296296297 | 49.895 |
| 0.5021412037037037 | 49.894 |
| 0.5021527777777778 | 49.895 |
| 0.5021643518518518 | 49.894 |
| 0.5021759259259259 | 49.894 |
| 0.5021875 | 49.893 |
| 0.502199074074074 | 49.893 |
| 0.5022106481481482 | 49.891 |
| 0.5022222222222222 | 49.89 |
| 0.5022337962962963 | 49.889 |
| 0.5022453703703703 | 49.889 |
| 0.5022569444444445 | 49.889 |
| 0.5022685185185185 | 49.888 |
| 0.5022800925925927 | 49.885 |
| 0.5022916666666667 | 49.882 |
| 0.5023032407407407 | 49.878 |
| 0.5023148148148148 | 49.874 |
| 0.5023263888888889 | 49.871 |
| 0.502337962962963 | 49.867 |
| 0.5023495370370371 | 49.865 |
| 0.5023611111111111 | 49.865 |
| 0.5023726851851852 | 49.863 |
| 0.5023842592592592 | 49.862 |
| 0.5023958333333333 | 49.862 |
| 0.5024074074074074 | 49.862 |
| 0.5024189814814815 | 49.863 |
| 0.5024305555555556 | 49.863 |
| 0.5024421296296296 | 49.865 |
| 0.5024537037037037 | 49.865 |
| 0.5024652777777777 | 49.866 |
| 0.5024768518518519 | 49.867 |
| 0.5024884259259259 | 49.867 |
| 0.5025000000000001 | 49.866 |
| 0.5025115740740741 | 49.864 |
| 0.5025231481481481 | 49.867 |
| 0.5025347222222222 | 49.869 |
| 0.5025462962962963 | 49.87 |
| 0.5025578703703704 | 49.872 |
| 0.5025694444444445 | 49.87 |
| 0.5025810185185186 | 49.869 |
| 0.5025925925925926 | 49.868 |
| 0.5026041666666666 | 49.866 |
| 0.5026157407407407 | 49.865 |
| 0.5026273148148148 | 49.863 |
| 0.5026388888888889 | 49.861 |
| 0.502650462962963 | 49.859 |
| 0.502662037037037 | 49.857 |
| 0.5026736111111111 | 49.852 |
| 0.5026851851851851 | 49.851 |
| 0.5026967592592593 | 49.848 |
| 0.5027083333333333 | 49.846 |
| 0.5027199074074075 | 49.844 |
| 0.5027314814814815 | 49.841 |
| 0.5027430555555555 | 49.84 |
| 0.5027546296296296 | 49.837 |
| 0.5027662037037037 | 49.833 |
| 0.5027777777777778 | 49.829 |
| 0.5027893518518519 | 49.826 |
| 0.502800925925926 | 49.822 |
| 0.5028125 | 49.822 |
| 0.502824074074074 | 49.821 |
| 0.5028356481481482 | 49.822 |
| 0.5028472222222222 | 49.821 |
| 0.5028587962962963 | 49.821 |
| 0.5028703703703704 | 49.821 |
| 0.5028819444444445 | 49.82 |
| 0.5028935185185185 | 49.817 |
| 0.5029050925925925 | 49.814 |
| 0.5029166666666667 | 49.811 |
| 0.5029282407407407 | 49.81 |
| 0.5029398148148149 | 49.81 |
| 0.5029513888888889 | 49.81 |
| 0.502962962962963 | 49.812 |
| 0.502974537037037 | 49.812 |
| 0.5029861111111111 | 49.812 |
| 0.5029976851851852 | 49.814 |
| 0.5030092592592593 | 49.814 |
| 0.5030208333333334 | 49.817 |
| 0.5030324074074074 | 49.818 |
| 0.5030439814814814 | 49.819 |
| 0.5030555555555556 | 49.819 |
| 0.5030671296296296 | 49.817 |
| 0.5030787037037037 | 49.816 |
| 0.5030902777777778 | 49.813 |
| 0.5031018518518519 | 49.81 |
| 0.5031134259259259 | 49.805 |
| 0.5031249999999999 | 49.802 |
| 0.5031365740740741 | 49.799 |
| 0.5031481481481481 | 49.797 |
| 0.5031597222222223 | 49.795 |
| 0.5031712962962963 | 49.795 |
| 0.5031828703703703 | 49.796 |
| 0.5031944444444444 | 49.797 |
| 0.5032060185185185 | 49.797 |
| 0.5032175925925926 | 49.799 |
| 0.5032291666666667 | 49.801 |
| 0.5032407407407408 | 49.803 |
| 0.5032523148148148 | 49.804 |
| 0.5032638888888888 | 49.806 |
| 0.503275462962963 | 49.805 |
| 0.503287037037037 | 49.804 |
| 0.5032986111111112 | 49.806 |
| 0.5033101851851852 | 49.807 |
| 0.5033217592592593 | 49.808 |
| 0.5033333333333333 | 49.809 |
| 0.5033449074074073 | 49.81 |
| 0.5033564814814815 | 49.814 |
| 0.5033680555555555 | 49.818 |
| 0.5033796296296297 | 49.818 |
| 0.5033912037037037 | 49.819 |
| 0.5034027777777778 | 49.819 |
| 0.5034143518518518 | 49.818 |
| 0.5034259259259259 | 49.819 |
| 0.5034375 | 49.819 |
| 0.5034490740740741 | 49.821 |
| 0.5034606481481482 | 49.821 |
| 0.5034722222222222 | 49.822 |
| 0.5034837962962962 | 49.822 |
| 0.5034953703703704 | 49.822 |
| 0.5035069444444444 | 49.822 |
| 0.5035185185185186 | 49.822 |
| 0.5035300925925926 | 49.823 |
| 0.5035416666666667 | 49.824 |
| 0.5035532407407407 | 49.824 |
| 0.5035648148148147 | 49.823 |
| 0.5035763888888889 | 49.822 |
| 0.5035879629629629 | 49.823 |
| 0.5035995370370371 | 49.825 |
| 0.5036111111111111 | 49.827 |
| 0.5036226851851852 | 49.83 |
| 0.5036342592592592 | 49.832 |
| 0.5036458333333333 | 49.834 |
| 0.5036574074074074 | 49.836 |
| 0.5036689814814815 | 49.838 |
| 0.5036805555555556 | 49.838 |
| 0.5036921296296296 | 49.839 |
| 0.5037037037037037 | 49.838 |
| 0.5037152777777778 | 49.838 |
| 0.5037268518518518 | 49.839 |
| 0.503738425925926 | 49.835 |
| 0.50375 | 49.833 |
| 0.5037615740740741 | 49.83 |
| 0.5037731481481481 | 49.826 |
| 0.5037847222222223 | 49.827 |
| 0.5037962962962963 | 49.829 |
| 0.5038078703703703 | 49.834 |
| 0.5038194444444445 | 49.839 |
| 0.5038310185185185 | 49.843 |
| 0.5038425925925926 | 49.849 |
| 0.5038541666666666 | 49.856 |
| 0.5038657407407408 | 49.863 |
| 0.5038773148148148 | 49.868 |
| 0.5038888888888889 | 49.877 |
| 0.503900462962963 | 49.884 |
| 0.503912037037037 | 49.892 |
| 0.5039236111111111 | 49.897 |
| 0.5039351851851852 | 49.901 |
| 0.5039467592592592 | 49.903 |
| 0.5039583333333334 | 49.903 |
| 0.5039699074074074 | 49.903 |
| 0.5039814814814815 | 49.903 |
| 0.5039930555555555 | 49.9 |
| 0.5040046296296297 | 49.897 |
| 0.5040162037037037 | 49.896 |
| 0.5040277777777777 | 49.894 |
| 0.5040393518518519 | 49.892 |
| 0.5040509259259259 | 49.89 |
| 0.5040625 | 49.887 |
| 0.504074074074074 | 49.885 |
| 0.5040856481481482 | 49.884 |
| 0.5040972222222222 | 49.884 |
| 0.5041087962962963 | 49.884 |
| 0.5041203703703704 | 49.883 |
| 0.5041319444444444 | 49.881 |
| 0.5041435185185185 | 49.879 |
| 0.5041550925925926 | 49.877 |
| 0.5041666666666667 | 49.875 |
| 0.5041782407407408 | 49.871 |
| 0.5041898148148148 | 49.868 |
| 0.5042013888888889 | 49.865 |
| 0.5042129629629629 | 49.861 |
| 0.5042245370370371 | 49.856 |
| 0.5042361111111111 | 49.853 |
| 0.5042476851851853 | 49.849 |
| 0.5042592592592593 | 49.846 |
| 0.5042708333333333 | 49.843 |
| 0.5042824074074074 | 49.84 |
| 0.5042939814814814 | 49.838 |
| 0.5043055555555556 | 49.839 |
| 0.5043171296296296 | 49.838 |
| 0.5043287037037038 | 49.837 |
| 0.5043402777777778 | 49.837 |
| 0.5043518518518518 | 49.837 |
| 0.5043634259259259 | 49.838 |
| 0.504375 | 49.84 |
| 0.5043865740740741 | 49.841 |
| 0.5043981481481482 | 49.842 |
| 0.5044097222222222 | 49.842 |
| 0.5044212962962963 | 49.842 |
| 0.5044328703703703 | 49.843 |
| 0.5044444444444445 | 49.845 |
| 0.5044560185185185 | 49.846 |
| 0.5044675925925927 | 49.845 |
| 0.5044791666666667 | 49.846 |
| 0.5044907407407407 | 49.846 |
| 0.5045023148148148 | 49.846 |
| 0.5045138888888888 | 49.846 |
| 0.504525462962963 | 49.843 |
| 0.504537037037037 | 49.842 |
| 0.5045486111111112 | 49.84 |
| 0.5045601851851852 | 49.841 |
| 0.5045717592592592 | 49.842 |
| 0.5045833333333333 | 49.843 |
| 0.5045949074074074 | 49.844 |
| 0.5046064814814815 | 49.847 |
| 0.5046180555555556 | 49.851 |
| 0.5046296296296297 | 49.852 |
| 0.5046412037037037 | 49.855 |
| 0.5046527777777777 | 49.858 |
| 0.5046643518518519 | 49.86 |
| 0.5046759259259259 | 49.861 |
| 0.5046875000000001 | 49.859 |
| 0.5046990740740741 | 49.857 |
| 0.5047106481481481 | 49.858 |
| 0.5047222222222222 | 49.858 |
| 0.5047337962962963 | 49.856 |
| 0.5047453703703704 | 49.856 |
| 0.5047569444444444 | 49.856 |
| 0.5047685185185186 | 49.856 |
| 0.5047800925925926 | 49.858 |
| 0.5047916666666666 | 49.857 |
| 0.5048032407407407 | 49.86 |
| 0.5048148148148148 | 49.861 |
| 0.5048263888888889 | 49.859 |
| 0.504837962962963 | 49.859 |
| 0.504849537037037 | 49.857 |
| 0.5048611111111111 | 49.854 |
| 0.5048726851851851 | 49.849 |
| 0.5048842592592593 | 49.846 |
| 0.5048958333333333 | 49.843 |
| 0.5049074074074075 | 49.844 |
| 0.5049189814814815 | 49.846 |
| 0.5049305555555555 | 49.846 |
| 0.5049421296296296 | 49.845 |
| 0.5049537037037037 | 49.845 |
| 0.5049652777777778 | 49.843 |
| 0.5049768518518518 | 49.843 |
| 0.504988425925926 | 49.842 |
| 0.505 | 49.841 |
| 0.505011574074074 | 49.839 |
| 0.5050231481481481 | 49.838 |
| 0.5050347222222222 | 49.835 |
| 0.5050462962962963 | 49.835 |
| 0.5050578703703704 | 49.835 |
| 0.5050694444444445 | 49.837 |
| 0.5050810185185185 | 49.838 |
| 0.5050925925925925 | 49.838 |
| 0.5051041666666667 | 49.844 |
| 0.5051157407407407 | 49.847 |
| 0.5051273148148149 | 49.855 |
| 0.5051388888888889 | 49.858 |
| 0.505150462962963 | 49.864 |
| 0.505162037037037 | 49.869 |
| 0.5051736111111111 | 49.874 |
| 0.5051851851851852 | 49.879 |
| 0.5051967592592593 | 49.882 |
| 0.5052083333333334 | 49.885 |
| 0.5052199074074074 | 49.887 |
| 0.5052314814814814 | 49.889 |
| 0.5052430555555555 | 49.892 |
| 0.5052546296296296 | 49.893 |
| 0.5052662037037037 | 49.894 |
| 0.5052777777777778 | 49.897 |
| 0.5052893518518519 | 49.898 |
| 0.5053009259259259 | 49.897 |
| 0.5053124999999999 | 49.897 |
| 0.5053240740740741 | 49.895 |
| 0.5053356481481481 | 49.892 |
| 0.5053472222222223 | 49.891 |
| 0.5053587962962963 | 49.892 |
| 0.5053703703703704 | 49.893 |
| 0.5053819444444444 | 49.895 |
| 0.5053935185185185 | 49.895 |
| 0.5054050925925926 | 49.897 |
| 0.5054166666666667 | 49.9 |
| 0.5054282407407408 | 49.904 |
| 0.5054398148148148 | 49.905 |
| 0.5054513888888889 | 49.908 |
| 0.5054629629629629 | 49.909 |
| 0.505474537037037 | 49.912 |
| 0.5054861111111111 | 49.914 |
| 0.5054976851851852 | 49.916 |
| 0.5055092592592593 | 49.916 |
| 0.5055208333333333 | 49.918 |
| 0.5055324074074073 | 49.915 |
| 0.5055439814814815 | 49.912 |
| 0.5055555555555555 | 49.909 |
| 0.5055671296296297 | 49.905 |
| 0.5055787037037037 | 49.9 |
| 0.5055902777777778 | 49.893 |
| 0.5056018518518518 | 49.893 |
| 0.505613425925926 | 49.894 |
| 0.505625 | 49.893 |
| 0.5056365740740741 | 49.893 |
| 0.5056481481481482 | 49.894 |
| 0.5056597222222222 | 49.892 |
| 0.5056712962962963 | 49.893 |
| 0.5056828703703703 | 49.892 |
| 0.5056944444444444 | 49.892 |
| 0.5057060185185185 | 49.893 |
| 0.5057175925925926 | 49.893 |
| 0.5057291666666667 | 49.894 |
| 0.5057407407407407 | 49.894 |
| 0.5057523148148148 | 49.896 |
| 0.5057638888888889 | 49.896 |
| 0.5057754629629629 | 49.897 |
| 0.5057870370370371 | 49.895 |
| 0.5057986111111111 | 49.895 |
| 0.5058101851851852 | 49.895 |
| 0.5058217592592592 | 49.894 |
| 0.5058333333333334 | 49.895 |
| 0.5058449074074074 | 49.893 |
| 0.5058564814814815 | 49.892 |
| 0.5058680555555556 | 49.892 |
| 0.5058796296296296 | 49.89 |
| 0.5058912037037037 | 49.89 |
| 0.5059027777777778 | 49.89 |
| 0.5059143518518519 | 49.891 |
| 0.5059259259259259 | 49.891 |
| 0.5059375 | 49.889 |
| 0.5059490740740741 | 49.89 |
| 0.5059606481481481 | 49.889 |
| 0.5059722222222222 | 49.888 |
| 0.5059837962962963 | 49.884 |
| 0.5059953703703703 | 49.883 |
| 0.5060069444444445 | 49.881 |
| 0.5060185185185185 | 49.876 |
| 0.5060300925925926 | 49.874 |
| 0.5060416666666666 | 49.874 |
| 0.5060532407407408 | 49.873 |
| 0.5060648148148148 | 49.876 |
| 0.506076388888889 | 49.877 |
| 0.506087962962963 | 49.877 |
| 0.506099537037037 | 49.877 |
| 0.5061111111111111 | 49.877 |
| 0.5061226851851852 | 49.878 |
| 0.5061342592592593 | 49.881 |
| 0.5061458333333334 | 49.88 |
| 0.5061574074074074 | 49.878 |
| 0.5061689814814815 | 49.876 |
| 0.5061805555555555 | 49.876 |
| 0.5061921296296296 | 49.878 |
| 0.5062037037037037 | 49.88 |
| 0.5062152777777778 | 49.884 |
| 0.5062268518518519 | 49.888 |
| 0.5062384259259259 | 49.891 |
| 0.50625 | 49.891 |
| 0.506261574074074 | 49.892 |
| 0.5062731481481482 | 49.896 |
| 0.5062847222222222 | 49.896 |
| 0.5062962962962964 | 49.896 |
| 0.5063078703703704 | 49.897 |
| 0.5063194444444444 | 49.898 |
| 0.5063310185185185 | 49.896 |
| 0.5063425925925926 | 49.897 |
| 0.5063541666666667 | 49.896 |
| 0.5063657407407408 | 49.895 |
| 0.5063773148148148 | 49.895 |
| 0.5063888888888889 | 49.896 |
| 0.5064004629629629 | 49.897 |
| 0.506412037037037 | 49.896 |
| 0.5064236111111111 | 49.899 |
| 0.5064351851851852 | 49.901 |
| 0.5064467592592593 | 49.905 |
| 0.5064583333333333 | 49.906 |
| 0.5064699074074074 | 49.907 |
| 0.5064814814814814 | 49.908 |
| 0.5064930555555556 | 49.907 |
| 0.5065046296296296 | 49.906 |
| 0.5065162037037038 | 49.904 |
| 0.5065277777777778 | 49.903 |
| 0.5065393518518518 | 49.902 |
| 0.5065509259259259 | 49.904 |
| 0.5065625 | 49.9 |
| 0.5065740740740741 | 49.899 |
| 0.5065856481481482 | 49.903 |
| 0.5065972222222223 | 49.907 |
| 0.5066087962962963 | 49.909 |
| 0.5066203703703703 | 49.91 |
| 0.5066319444444445 | 49.912 |
| 0.5066435185185185 | 49.914 |
| 0.5066550925925926 | 49.917 |
| 0.5066666666666667 | 49.919 |
| 0.5066782407407407 | 49.922 |
| 0.5066898148148148 | 49.925 |
| 0.5067013888888888 | 49.927 |
| 0.506712962962963 | 49.926 |
| 0.506724537037037 | 49.926 |
| 0.5067361111111112 | 49.927 |
| 0.5067476851851852 | 49.93 |
| 0.5067592592592592 | 49.931 |
| 0.5067708333333333 | 49.934 |
| 0.5067824074074074 | 49.933 |
| 0.5067939814814815 | 49.933 |
| 0.5068055555555556 | 49.932 |
| 0.5068171296296297 | 49.929 |
| 0.5068287037037037 | 49.927 |
| 0.5068402777777777 | 49.928 |
| 0.5068518518518519 | 49.925 |
| 0.5068634259259259 | 49.925 |
| 0.506875 | 49.925 |
| 0.5068865740740741 | 49.926 |
| 0.5068981481481482 | 49.926 |
| 0.5069097222222222 | 49.928 |
| 0.5069212962962962 | 49.93 |
| 0.5069328703703704 | 49.931 |
| 0.5069444444444444 | 49.933 |
| 0.5069560185185186 | 49.933 |
| 0.5069675925925926 | 49.934 |
| 0.5069791666666666 | 49.935 |
| 0.5069907407407407 | 49.936 |
| 0.5070023148148148 | 49.938 |
| 0.5070138888888889 | 49.943 |
| 0.507025462962963 | 49.946 |
| 0.5070370370370371 | 49.949 |
| 0.5070486111111111 | 49.951 |
| 0.5070601851851851 | 49.953 |
| 0.5070717592592593 | 49.953 |
| 0.5070833333333333 | 49.954 |
| 0.5070949074074075 | 49.957 |
| 0.5071064814814815 | 49.958 |
| 0.5071180555555556 | 49.957 |
| 0.5071296296296296 | 49.957 |
| 0.5071412037037036 | 49.957 |
| 0.5071527777777778 | 49.956 |
| 0.5071643518518518 | 49.953 |
| 0.507175925925926 | 49.954 |
| 0.5071875 | 49.957 |
| 0.507199074074074 | 49.956 |
| 0.5072106481481481 | 49.956 |
| 0.5072222222222222 | 49.958 |
| 0.5072337962962963 | 49.958 |
| 0.5072453703703704 | 49.957 |
| 0.5072569444444445 | 49.956 |
| 0.5072685185185185 | 49.954 |
| 0.5072800925925925 | 49.952 |
| 0.5072916666666667 | 49.951 |
| 0.5073032407407407 | 49.95 |
| 0.5073148148148149 | 49.95 |
| 0.5073263888888889 | 49.949 |
| 0.507337962962963 | 49.946 |
| 0.507349537037037 | 49.947 |
| 0.507361111111111 | 49.946 |
| 0.5073726851851852 | 49.942 |
| 0.5073842592592592 | 49.941 |
| 0.5073958333333334 | 49.94 |
| 0.5074074074074074 | 49.936 |
| 0.5074189814814815 | 49.935 |
| 0.5074305555555555 | 49.932 |
| 0.5074421296296296 | 49.93 |
| 0.5074537037037037 | 49.931 |
| 0.5074652777777778 | 49.933 |
| 0.5074768518518519 | 49.932 |
| 0.5074884259259259 | 49.932 |
| 0.5075 | 49.932 |
| 0.5075115740740741 | 49.931 |
| 0.5075231481481481 | 49.933 |
| 0.5075347222222223 | 49.931 |
| 0.5075462962962963 | 49.93 |
| 0.5075578703703704 | 49.927 |
| 0.5075694444444444 | 49.926 |
| 0.5075810185185184 | 49.925 |
| 0.5075925925925926 | 49.93 |
| 0.5076041666666666 | 49.934 |
| 0.5076157407407408 | 49.935 |
| 0.5076273148148148 | 49.935 |
| 0.5076388888888889 | 49.936 |
| 0.5076504629629629 | 49.936 |
| 0.507662037037037 | 49.934 |
| 0.5076736111111111 | 49.933 |
| 0.5076851851851852 | 49.929 |
| 0.5076967592592593 | 49.924 |
| 0.5077083333333333 | 49.92 |
| 0.5077199074074074 | 49.916 |
| 0.5077314814814815 | 49.915 |
| 0.5077430555555555 | 49.916 |
| 0.5077546296296297 | 49.914 |
| 0.5077662037037037 | 49.914 |
| 0.5077777777777778 | 49.913 |
| 0.5077893518518518 | 49.911 |
| 0.507800925925926 | 49.909 |
| 0.5078125 | 49.908 |
| 0.507824074074074 | 49.905 |
| 0.5078356481481482 | 49.902 |
| 0.5078472222222222 | 49.9 |
| 0.5078587962962963 | 49.899 |
| 0.5078703703703703 | 49.898 |
| 0.5078819444444445 | 49.897 |
| 0.5078935185185185 | 49.897 |
| 0.5079050925925926 | 49.899 |
| 0.5079166666666667 | 49.901 |
| 0.5079282407407407 | 49.902 |
| 0.5079398148148148 | 49.902 |
| 0.5079513888888889 | 49.906 |
| 0.507962962962963 | 49.908 |
| 0.5079745370370371 | 49.91 |
| 0.5079861111111111 | 49.912 |
| 0.5079976851851852 | 49.918 |
| 0.5080092592592592 | 49.918 |
| 0.5080208333333334 | 49.919 |
| 0.5080324074074074 | 49.922 |
| 0.5080439814814816 | 49.921 |
| 0.5080555555555556 | 49.924 |
| 0.5080671296296296 | 49.93 |
| 0.5080787037037037 | 49.934 |
| 0.5080902777777777 | 49.936 |
| 0.5081018518518519 | 49.938 |
| 0.5081134259259259 | 49.94 |
| 0.508125 | 49.943 |
| 0.5081365740740741 | 49.946 |
| 0.5081481481481481 | 49.947 |
| 0.5081597222222222 | 49.951 |
| 0.5081712962962963 | 49.954 |
| 0.5081828703703704 | 49.955 |
| 0.5081944444444445 | 49.954 |
| 0.5082060185185185 | 49.953 |
| 0.5082175925925926 | 49.952 |
| 0.5082291666666666 | 49.952 |
| 0.5082407407407408 | 49.952 |
| 0.5082523148148148 | 49.95 |
| 0.508263888888889 | 49.946 |
| 0.508275462962963 | 49.944 |
| 0.508287037037037 | 49.943 |
| 0.5082986111111111 | 49.941 |
| 0.5083101851851851 | 49.938 |
| 0.5083217592592593 | 49.934 |
| 0.5083333333333333 | 49.932 |
| 0.5083449074074075 | 49.931 |
| 0.5083564814814815 | 49.93 |
| 0.5083680555555555 | 49.928 |
| 0.5083796296296296 | 49.928 |
| 0.5083912037037037 | 49.929 |
| 0.5084027777777778 | 49.932 |
| 0.5084143518518519 | 49.932 |
| 0.508425925925926 | 49.933 |
| 0.5084375 | 49.932 |
| 0.508449074074074 | 49.931 |
| 0.5084606481481482 | 49.93 |
| 0.5084722222222222 | 49.929 |
| 0.5084837962962964 | 49.929 |
| 0.5084953703703704 | 49.929 |
| 0.5085069444444444 | 49.931 |
| 0.5085185185185185 | 49.928 |
| 0.5085300925925925 | 49.929 |
| 0.5085416666666667 | 49.928 |
| 0.5085532407407407 | 49.929 |
| 0.5085648148148149 | 49.929 |
| 0.5085763888888889 | 49.931 |
| 0.5085879629629629 | 49.933 |
| 0.508599537037037 | 49.935 |
| 0.5086111111111111 | 49.935 |
| 0.5086226851851852 | 49.937 |
| 0.5086342592592593 | 49.937 |
| 0.5086458333333334 | 49.94 |
| 0.5086574074074074 | 49.943 |
| 0.5086689814814814 | 49.944 |
| 0.5086805555555556 | 49.945 |
| 0.5086921296296296 | 49.945 |
| 0.5087037037037038 | 49.947 |
| 0.5087152777777778 | 49.948 |
| 0.5087268518518518 | 49.947 |
| 0.5087384259259259 | 49.945 |
| 0.50875 | 49.944 |
| 0.5087615740740741 | 49.943 |
| 0.5087731481481481 | 49.939 |
| 0.5087847222222223 | 49.939 |
| 0.5087962962962963 | 49.936 |
| 0.5088078703703703 | 49.932 |
| 0.5088194444444444 | 49.929 |
| 0.5088310185185185 | 49.928 |
| 0.5088425925925926 | 49.925 |
| 0.5088541666666667 | 49.923 |
| 0.5088657407407408 | 49.924 |
| 0.5088773148148148 | 49.923 |
| 0.5088888888888888 | 49.922 |
| 0.508900462962963 | 49.921 |
| 0.508912037037037 | 49.922 |
| 0.5089236111111112 | 49.922 |
| 0.5089351851851852 | 49.921 |
| 0.5089467592592593 | 49.92 |
| 0.5089583333333333 | 49.92 |
| 0.5089699074074074 | 49.919 |
| 0.5089814814814815 | 49.916 |
| 0.5089930555555555 | 49.915 |
| 0.5090046296296297 | 49.915 |
| 0.5090162037037037 | 49.915 |
| 0.5090277777777777 | 49.913 |
| 0.5090393518518518 | 49.911 |
| 0.5090509259259259 | 49.911 |
| 0.5090625 | 49.908 |
| 0.5090740740740741 | 49.908 |
| 0.5090856481481482 | 49.909 |
| 0.5090972222222222 | 49.911 |
| 0.5091087962962962 | 49.912 |
| 0.5091203703703704 | 49.913 |
| 0.5091319444444444 | 49.913 |
| 0.5091435185185186 | 49.915 |
| 0.5091550925925926 | 49.915 |
| 0.5091666666666667 | 49.914 |
| 0.5091782407407407 | 49.912 |
| 0.5091898148148148 | 49.912 |
| 0.5092013888888889 | 49.909 |
| 0.509212962962963 | 49.909 |
| 0.5092245370370371 | 49.908 |
| 0.5092361111111111 | 49.907 |
| 0.5092476851851852 | 49.906 |
| 0.5092592592592592 | 49.91 |
| 0.5092708333333333 | 49.915 |
| 0.5092824074074074 | 49.916 |
| 0.5092939814814815 | 49.916 |
| 0.5093055555555556 | 49.916 |
| 0.5093171296296296 | 49.915 |
| 0.5093287037037036 | 49.914 |
| 0.5093402777777778 | 49.91 |
| 0.5093518518518518 | 49.904 |
| 0.509363425925926 | 49.897 |
| 0.509375 | 49.89 |
| 0.5093865740740741 | 49.885 |
| 0.5093981481481481 | 49.881 |
| 0.5094097222222222 | 49.878 |
| 0.5094212962962963 | 49.874 |
| 0.5094328703703704 | 49.871 |
| 0.5094444444444445 | 49.869 |
| 0.5094560185185185 | 49.867 |
| 0.5094675925925926 | 49.865 |
| 0.5094791666666666 | 49.865 |
| 0.5094907407407407 | 49.862 |
| 0.5095023148148148 | 49.861 |
| 0.5095138888888889 | 49.86 |
| 0.509525462962963 | 49.863 |
| 0.509537037037037 | 49.865 |
| 0.509548611111111 | 49.868 |
| 0.5095601851851852 | 49.87 |
| 0.5095717592592592 | 49.873 |
| 0.5095833333333334 | 49.878 |
| 0.5095949074074074 | 49.881 |
| 0.5096064814814815 | 49.884 |
| 0.5096180555555555 | 49.888 |
| 0.5096296296296297 | 49.888 |
| 0.5096412037037037 | 49.89 |
| 0.5096527777777778 | 49.889 |
| 0.5096643518518519 | 49.89 |
| 0.5096759259259259 | 49.891 |
| 0.5096875 | 49.895 |
| 0.5096990740740741 | 49.897 |
| 0.5097106481481481 | 49.899 |
| 0.5097222222222222 | 49.9 |
| 0.5097337962962963 | 49.899 |
| 0.5097453703703704 | 49.899 |
| 0.5097569444444444 | 49.9 |
| 0.5097685185185185 | 49.899 |
| 0.5097800925925926 | 49.897 |
| 0.5097916666666666 | 49.898 |
| 0.5098032407407408 | 49.899 |
| 0.5098148148148148 | 49.9 |
| 0.5098263888888889 | 49.898 |
| 0.5098379629629629 | 49.898 |
| 0.5098495370370371 | 49.899 |
| 0.5098611111111111 | 49.899 |
| 0.5098726851851852 | 49.899 |
| 0.5098842592592593 | 49.898 |
| 0.5098958333333333 | 49.899 |
| 0.5099074074074074 | 49.899 |
| 0.5099189814814815 | 49.901 |
| 0.5099305555555556 | 49.902 |
| 0.5099421296296297 | 49.902 |
| 0.5099537037037037 | 49.902 |
| 0.5099652777777778 | 49.9 |
| 0.5099768518518518 | 49.898 |
| 0.5099884259259259 | 49.897 |
| 0.51 | 49.897 |
| 0.510011574074074 | 49.896 |
| 0.5100231481481482 | 49.897 |
| 0.5100347222222222 | 49.898 |
| 0.5100462962962963 | 49.899 |
| 0.5100578703703703 | 49.897 |
| 0.5100694444444445 | 49.897 |
| 0.5100810185185185 | 49.896 |
| 0.5100925925925927 | 49.891 |
| 0.5101041666666667 | 49.89 |
| 0.5101157407407407 | 49.891 |
| 0.5101273148148148 | 49.891 |
| 0.5101388888888889 | 49.891 |
| 0.510150462962963 | 49.892 |
| 0.5101620370370371 | 49.895 |
| 0.5101736111111111 | 49.896 |
| 0.5101851851851852 | 49.899 |
| 0.5101967592592592 | 49.9 |
| 0.5102083333333333 | 49.901 |
| 0.5102199074074074 | 49.903 |
| 0.5102314814814815 | 49.904 |
| 0.5102430555555556 | 49.906 |
| 0.5102546296296296 | 49.904 |
| 0.5102662037037037 | 49.904 |
| 0.5102777777777777 | 49.902 |
| 0.5102893518518519 | 49.902 |
| 0.5103009259259259 | 49.9 |
| 0.5103125000000001 | 49.898 |
| 0.5103240740740741 | 49.896 |
| 0.5103356481481481 | 49.895 |
| 0.5103472222222222 | 49.895 |
| 0.5103587962962963 | 49.893 |
| 0.5103703703703704 | 49.894 |
| 0.5103819444444445 | 49.892 |
| 0.5103935185185186 | 49.889 |
| 0.5104050925925926 | 49.887 |
| 0.5104166666666666 | 49.883 |
| 0.5104282407407407 | 49.879 |
| 0.5104398148148148 | 49.875 |
| 0.5104513888888889 | 49.873 |
| 0.510462962962963 | 49.872 |
| 0.510474537037037 | 49.873 |
| 0.5104861111111111 | 49.875 |
| 0.5104976851851851 | 49.878 |
| 0.5105092592592593 | 49.877 |
| 0.5105208333333333 | 49.876 |
| 0.5105324074074075 | 49.875 |
| 0.5105439814814815 | 49.873 |
| 0.5105555555555555 | 49.873 |
| 0.5105671296296296 | 49.87 |
| 0.5105787037037037 | 49.868 |
| 0.5105902777777778 | 49.866 |
| 0.5106018518518519 | 49.865 |
| 0.510613425925926 | 49.865 |
| 0.510625 | 49.866 |
| 0.510636574074074 | 49.868 |
| 0.5106481481481482 | 49.871 |
| 0.5106597222222222 | 49.872 |
| 0.5106712962962963 | 49.871 |
| 0.5106828703703704 | 49.871 |
| 0.5106944444444445 | 49.872 |
| 0.5107060185185185 | 49.872 |
| 0.5107175925925925 | 49.872 |
| 0.5107291666666667 | 49.871 |
| 0.5107407407407407 | 49.869 |
| 0.5107523148148149 | 49.868 |
| 0.5107638888888889 | 49.867 |
| 0.510775462962963 | 49.867 |
| 0.510787037037037 | 49.866 |
| 0.5107986111111111 | 49.867 |
| 0.5108101851851852 | 49.868 |
| 0.5108217592592593 | 49.87 |
| 0.5108333333333334 | 49.869 |
| 0.5108449074074074 | 49.869 |
| 0.5108564814814814 | 49.869 |
| 0.5108680555555556 | 49.869 |
| 0.5108796296296296 | 49.867 |
| 0.5108912037037037 | 49.866 |
| 0.5109027777777778 | 49.864 |
| 0.5109143518518519 | 49.861 |
| 0.5109259259259259 | 49.861 |
| 0.5109374999999999 | 49.859 |
| 0.5109490740740741 | 49.86 |
| 0.5109606481481481 | 49.862 |
| 0.5109722222222223 | 49.864 |
| 0.5109837962962963 | 49.867 |
| 0.5109953703703703 | 49.869 |
| 0.5110069444444444 | 49.873 |
| 0.5110185185185185 | 49.878 |
| 0.5110300925925926 | 49.881 |
| 0.5110416666666667 | 49.885 |
| 0.5110532407407408 | 49.887 |
| 0.5110648148148148 | 49.892 |
| 0.5110763888888888 | 49.897 |
| 0.511087962962963 | 49.901 |
| 0.511099537037037 | 49.903 |
| 0.5111111111111112 | 49.905 |
| 0.5111226851851852 | 49.906 |
| 0.5111342592592593 | 49.905 |
| 0.5111458333333333 | 49.905 |
| 0.5111574074074073 | 49.905 |
| 0.5111689814814815 | 49.904 |
| 0.5111805555555555 | 49.905 |
| 0.5111921296296297 | 49.906 |
| 0.5112037037037037 | 49.904 |
| 0.5112152777777778 | 49.905 |
| 0.5112268518518518 | 49.905 |
| 0.5112384259259259 | 49.904 |
| 0.51125 | 49.901 |
| 0.5112615740740741 | 49.901 |
| 0.5112731481481482 | 49.9 |
| 0.5112847222222222 | 49.898 |
| 0.5112962962962962 | 49.899 |
| 0.5113078703703704 | 49.899 |
| 0.5113194444444444 | 49.899 |
| 0.5113310185185186 | 49.901 |
| 0.5113425925925926 | 49.9 |
| 0.5113541666666667 | 49.902 |
| 0.5113657407407407 | 49.901 |
| 0.5113773148148147 | 49.901 |
| 0.5113888888888889 | 49.898 |
| 0.5114004629629629 | 49.896 |
| 0.5114120370370371 | 49.894 |
| 0.5114236111111111 | 49.892 |
| 0.5114351851851852 | 49.889 |
| 0.5114467592592592 | 49.888 |
| 0.5114583333333333 | 49.885 |
| 0.5114699074074074 | 49.884 |
| 0.5114814814814815 | 49.882 |
| 0.5114930555555556 | 49.883 |
| 0.5115046296296296 | 49.883 |
| 0.5115162037037037 | 49.885 |
| 0.5115277777777778 | 49.885 |
| 0.5115393518518518 | 49.888 |
| 0.511550925925926 | 49.888 |
| 0.5115625 | 49.888 |
| 0.5115740740740741 | 49.888 |
| 0.5115856481481481 | 49.888 |
| 0.5115972222222221 | 49.889 |
| 0.5116087962962963 | 49.889 |
| 0.5116203703703703 | 49.89 |
| 0.5116319444444445 | 49.891 |
| 0.5116435185185185 | 49.891 |
| 0.5116550925925926 | 49.891 |
| 0.5116666666666666 | 49.89 |
| 0.5116782407407408 | 49.89 |
| 0.5116898148148148 | 49.888 |
| 0.5117013888888889 | 49.887 |
| 0.511712962962963 | 49.885 |
| 0.511724537037037 | 49.883 |
| 0.5117361111111111 | 49.879 |
| 0.5117476851851852 | 49.878 |
| 0.5117592592592592 | 49.876 |
| 0.5117708333333334 | 49.874 |
| 0.5117824074074074 | 49.874 |
| 0.5117939814814815 | 49.873 |
| 0.5118055555555555 | 49.872 |
| 0.5118171296296297 | 49.873 |
| 0.5118287037037037 | 49.873 |
| 0.5118402777777779 | 49.873 |
| 0.5118518518518519 | 49.873 |
| 0.5118634259259259 | 49.869 |
| 0.511875 | 49.867 |
| 0.511886574074074 | 49.862 |
| 0.5118981481481482 | 49.858 |
| 0.5119097222222222 | 49.854 |
| 0.5119212962962963 | 49.852 |
| 0.5119328703703704 | 49.851 |
| 0.5119444444444444 | 49.851 |
| 0.5119560185185185 | 49.851 |
| 0.5119675925925926 | 49.851 |
| 0.5119791666666667 | 49.853 |
| 0.5119907407407408 | 49.856 |
| 0.5120023148148148 | 49.857 |
| 0.5120138888888889 | 49.856 |
| 0.5120254629629629 | 49.856 |
| 0.5120370370370371 | 49.854 |
| 0.5120486111111111 | 49.853 |
| 0.5120601851851853 | 49.852 |
| 0.5120717592592593 | 49.851 |
| 0.5120833333333333 | 49.853 |
| 0.5120949074074074 | 49.855 |
| 0.5121064814814814 | 49.859 |
| 0.5121180555555556 | 49.862 |
| 0.5121296296296296 | 49.867 |
| 0.5121412037037038 | 49.87 |
| 0.5121527777777778 | 49.872 |
| 0.5121643518518518 | 49.873 |
| 0.5121759259259259 | 49.872 |
| 0.5121875 | 49.872 |
| 0.5121990740740741 | 49.872 |
| 0.5122106481481482 | 49.87 |
| 0.5122222222222222 | 49.874 |
| 0.5122337962962963 | 49.875 |
| 0.5122453703703703 | 49.875 |
| 0.5122569444444445 | 49.875 |
| 0.5122685185185185 | 49.877 |
| 0.5122800925925927 | 49.879 |
| 0.5122916666666667 | 49.882 |
| 0.5123032407407407 | 49.886 |
| 0.5123148148148148 | 49.889 |
| 0.5123263888888888 | 49.892 |
| 0.512337962962963 | 49.894 |
| 0.512349537037037 | 49.898 |
| 0.5123611111111112 | 49.899 |
| 0.5123726851851852 | 49.899 |
| 0.5123842592592592 | 49.897 |
| 0.5123958333333333 | 49.894 |
| 0.5124074074074074 | 49.891 |
| 0.5124189814814815 | 49.889 |
| 0.5124305555555556 | 49.887 |
| 0.5124421296296297 | 49.884 |
| 0.5124537037037037 | 49.884 |
| 0.5124652777777777 | 49.885 |
| 0.5124768518518519 | 49.887 |
| 0.5124884259259259 | 49.89 |
| 0.5125000000000001 | 49.894 |
| 0.5125115740740741 | 49.897 |
| 0.5125231481481481 | 49.899 |
| 0.5125347222222222 | 49.902 |
| 0.5125462962962963 | 49.907 |
| 0.5125578703703704 | 49.912 |
| 0.5125694444444444 | 49.917 |
| 0.5125810185185186 | 49.922 |
| 0.5125925925925926 | 49.928 |
| 0.5126041666666666 | 49.934 |
| 0.5126157407407407 | 49.938 |
| 0.5126273148148148 | 49.942 |
| 0.5126388888888889 | 49.944 |
| 0.512650462962963 | 49.946 |
| 0.512662037037037 | 49.948 |
| 0.5126736111111111 | 49.95 |
| 0.5126851851851851 | 49.949 |
| 0.5126967592592593 | 49.949 |
| 0.5127083333333333 | 49.948 |
| 0.5127199074074075 | 49.947 |
| 0.5127314814814815 | 49.947 |
| 0.5127430555555555 | 49.947 |
| 0.5127546296296296 | 49.947 |
| 0.5127662037037037 | 49.947 |
| 0.5127777777777778 | 49.946 |
| 0.5127893518518518 | 49.947 |
| 0.512800925925926 | 49.948 |
| 0.5128125 | 49.95 |
| 0.512824074074074 | 49.951 |
| 0.5128356481481481 | 49.951 |
| 0.5128472222222222 | 49.949 |
| 0.5128587962962963 | 49.949 |
| 0.5128703703703704 | 49.949 |
| 0.5128819444444445 | 49.947 |
| 0.5128935185185185 | 49.945 |
| 0.5129050925925925 | 49.945 |
| 0.5129166666666667 | 49.943 |
| 0.5129282407407407 | 49.941 |
| 0.5129398148148149 | 49.94 |
| 0.5129513888888889 | 49.939 |
| 0.512962962962963 | 49.939 |
| 0.512974537037037 | 49.94 |
| 0.5129861111111111 | 49.938 |
| 0.5129976851851852 | 49.939 |
| 0.5130092592592593 | 49.939 |
| 0.5130208333333334 | 49.939 |
| 0.5130324074074074 | 49.942 |
| 0.5130439814814814 | 49.943 |
| 0.5130555555555555 | 49.944 |
| 0.5130671296296296 | 49.945 |
| 0.5130787037037037 | 49.945 |
| 0.5130902777777778 | 49.945 |
| 0.5131018518518519 | 49.944 |
| 0.5131134259259259 | 49.943 |
| 0.5131249999999999 | 49.943 |
| 0.5131365740740741 | 49.942 |
| 0.5131481481481481 | 49.941 |
| 0.5131597222222223 | 49.939 |
| 0.5131712962962963 | 49.937 |
| 0.5131828703703704 | 49.937 |
| 0.5131944444444444 | 49.935 |
| 0.5132060185185185 | 49.934 |
| 0.5132175925925926 | 49.931 |
| 0.5132291666666667 | 49.931 |
| 0.5132407407407408 | 49.929 |
| 0.5132523148148148 | 49.927 |
| 0.5132638888888889 | 49.925 |
| 0.5132754629629629 | 49.925 |
| 0.513287037037037 | 49.923 |
| 0.5132986111111111 | 49.922 |
| 0.5133101851851852 | 49.923 |
| 0.5133217592592593 | 49.924 |
| 0.5133333333333333 | 49.926 |
| 0.5133449074074073 | 49.93 |
| 0.5133564814814815 | 49.934 |
| 0.5133680555555555 | 49.938 |
| 0.5133796296296297 | 49.941 |
| 0.5133912037037037 | 49.942 |
| 0.5134027777777778 | 49.942 |
| 0.5134143518518518 | 49.942 |
| 0.513425925925926 | 49.939 |
| 0.5134375 | 49.937 |
| 0.5134490740740741 | 49.937 |
| 0.5134606481481482 | 49.937 |
| 0.5134722222222222 | 49.937 |
| 0.5134837962962963 | 49.94 |
| 0.5134953703703703 | 49.941 |
| 0.5135069444444444 | 49.944 |
| 0.5135185185185185 | 49.946 |
| 0.5135300925925926 | 49.95 |
| 0.5135416666666667 | 49.954 |
| 0.5135532407407407 | 49.958 |
| 0.5135648148148148 | 49.963 |
| 0.5135763888888889 | 49.968 |
| 0.5135879629629629 | 49.968 |
| 0.5135995370370371 | 49.97 |
| 0.5136111111111111 | 49.972 |
| 0.5136226851851852 | 49.976 |
| 0.5136342592592592 | 49.981 |
| 0.5136458333333334 | 49.985 |
| 0.5136574074074074 | 49.99 |
| 0.5136689814814815 | 49.992 |
| 0.5136805555555556 | 49.997 |
| 0.5136921296296296 | 50.001 |
| 0.5137037037037037 | 50.004 |
| 0.5137152777777778 | 50.007 |
| 0.5137268518518519 | 50.008 |
| 0.513738425925926 | 50.007 |
| 0.51375 | 50.007 |
| 0.5137615740740741 | 50.007 |
| 0.5137731481481481 | 50.005 |
| 0.5137847222222222 | 50.004 |
| 0.5137962962962963 | 50.003 |
| 0.5138078703703703 | 50.004 |
| 0.5138194444444445 | 50.004 |
| 0.5138310185185185 | 50.004 |
| 0.5138425925925926 | 50.003 |
| 0.5138541666666666 | 50.002 |
| 0.5138657407407408 | 50.001 |
| 0.5138773148148148 | 50.002 |
| 0.513888888888889 | 50.001 |
| 0.513900462962963 | 50.001 |
| 0.513912037037037 | 49.996 |
| 0.5139236111111111 | 49.991 |
| 0.5139351851851852 | 49.985 |
| 0.5139467592592593 | 49.98 |
| 0.5139583333333334 | 49.974 |
| 0.5139699074074074 | 49.975 |
| 0.5139814814814815 | 49.974 |
| 0.5139930555555555 | 49.973 |
| 0.5140046296296296 | 49.973 |
| 0.5140162037037037 | 49.977 |
| 0.5140277777777778 | 49.98 |
| 0.5140393518518519 | 49.983 |
| 0.5140509259259259 | 49.984 |
| 0.5140625 | 49.984 |
| 0.514074074074074 | 49.984 |
| 0.5140856481481482 | 49.984 |
| 0.5140972222222222 | 49.984 |
| 0.5141087962962964 | 49.984 |
| 0.5141203703703704 | 49.984 |
| 0.5141319444444444 | 49.986 |
| 0.5141435185185185 | 49.988 |
| 0.5141550925925926 | 49.99 |
| 0.5141666666666667 | 49.991 |
| 0.5141782407407408 | 49.994 |
| 0.5141898148148148 | 49.994 |
| 0.5142013888888889 | 49.995 |
| 0.5142129629629629 | 49.995 |
| 0.514224537037037 | 49.995 |
| 0.5142361111111111 | 49.991 |
| 0.5142476851851852 | 49.988 |
| 0.5142592592592593 | 49.985 |
| 0.5142708333333333 | 49.985 |
| 0.5142824074074074 | 49.985 |
| 0.5142939814814814 | 49.985 |
| 0.5143055555555556 | 49.985 |
| 0.5143171296296296 | 49.985 |
| 0.5143287037037038 | 49.984 |
| 0.5143402777777778 | 49.982 |
| 0.5143518518518518 | 49.981 |
| 0.5143634259259259 | 49.98 |
| 0.514375 | 49.977 |
| 0.5143865740740741 | 49.977 |
| 0.5143981481481482 | 49.977 |
| 0.5144097222222223 | 49.977 |
| 0.5144212962962963 | 49.977 |
| 0.5144328703703703 | 49.977 |
| 0.5144444444444445 | 49.976 |
| 0.5144560185185185 | 49.975 |
| 0.5144675925925926 | 49.973 |
| 0.5144791666666667 | 49.97 |
| 0.5144907407407407 | 49.967 |
| 0.5145023148148148 | 49.967 |
| 0.5145138888888888 | 49.966 |
| 0.514525462962963 | 49.964 |
| 0.514537037037037 | 49.964 |
| 0.5145486111111112 | 49.963 |
| 0.5145601851851852 | 49.96 |
| 0.5145717592592592 | 49.958 |